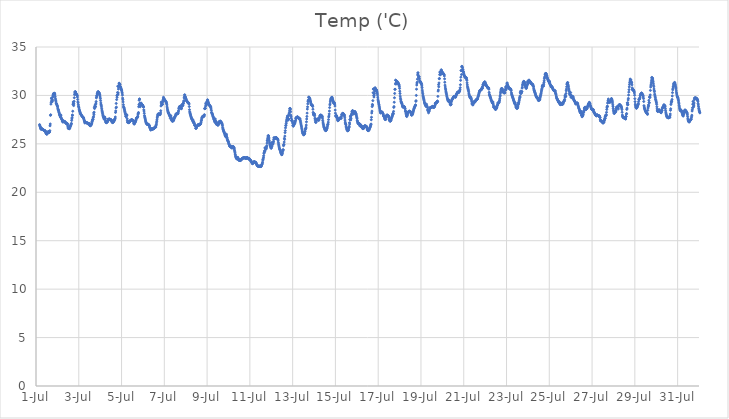
| Category | Temp ('C) |
|---|---|
| 44743.166666666664 | 26.988 |
| 44743.177083333336 | 26.906 |
| 44743.1875 | 26.806 |
| 44743.197916666664 | 26.741 |
| 44743.208333333336 | 26.634 |
| 44743.21875 | 26.656 |
| 44743.229166666664 | 26.513 |
| 44743.239583333336 | 26.539 |
| 44743.25 | 26.641 |
| 44743.260416666664 | 26.567 |
| 44743.270833333336 | 26.55 |
| 44743.28125 | 26.513 |
| 44743.291666666664 | 26.511 |
| 44743.302083333336 | 26.483 |
| 44743.3125 | 26.475 |
| 44743.322916666664 | 26.474 |
| 44743.333333333336 | 26.46 |
| 44743.34375 | 26.45 |
| 44743.354166666664 | 26.429 |
| 44743.364583333336 | 26.416 |
| 44743.375 | 26.395 |
| 44743.385416666664 | 26.378 |
| 44743.395833333336 | 26.348 |
| 44743.40625 | 26.352 |
| 44743.416666666664 | 26.364 |
| 44743.427083333336 | 26.352 |
| 44743.4375 | 26.308 |
| 44743.447916666664 | 26.232 |
| 44743.458333333336 | 26.173 |
| 44743.46875 | 26.1 |
| 44743.479166666664 | 26.058 |
| 44743.489583333336 | 26.029 |
| 44743.5 | 26.015 |
| 44743.510416666664 | 26.007 |
| 44743.520833333336 | 26.026 |
| 44743.53125 | 26.082 |
| 44743.541666666664 | 26.151 |
| 44743.552083333336 | 26.187 |
| 44743.5625 | 26.222 |
| 44743.572916666664 | 26.253 |
| 44743.583333333336 | 26.269 |
| 44743.59375 | 26.233 |
| 44743.604166666664 | 26.262 |
| 44743.614583333336 | 26.18 |
| 44743.625 | 26.202 |
| 44743.635416666664 | 26.241 |
| 44743.645833333336 | 26.361 |
| 44743.65625 | 26.865 |
| 44743.666666666664 | 27.052 |
| 44743.677083333336 | 27.94 |
| 44743.6875 | 28.002 |
| 44743.697916666664 | 29.102 |
| 44743.708333333336 | 29.297 |
| 44743.71875 | 29.723 |
| 44743.729166666664 | 29.654 |
| 44743.739583333336 | 29.479 |
| 44743.75 | 29.434 |
| 44743.760416666664 | 29.356 |
| 44743.770833333336 | 29.533 |
| 44743.78125 | 29.817 |
| 44743.791666666664 | 29.958 |
| 44743.802083333336 | 30.051 |
| 44743.8125 | 30.108 |
| 44743.822916666664 | 30.201 |
| 44743.833333333336 | 30.197 |
| 44743.84375 | 30.188 |
| 44743.854166666664 | 30.136 |
| 44743.864583333336 | 30.143 |
| 44743.875 | 30.231 |
| 44743.885416666664 | 30.05 |
| 44743.895833333336 | 29.87 |
| 44743.90625 | 29.69 |
| 44743.916666666664 | 29.534 |
| 44743.927083333336 | 29.438 |
| 44743.9375 | 29.321 |
| 44743.947916666664 | 29.168 |
| 44743.958333333336 | 29.138 |
| 44743.96875 | 29.11 |
| 44743.979166666664 | 29.02 |
| 44743.989583333336 | 28.963 |
| 44744.0 | 28.898 |
| 44744.010416666664 | 28.813 |
| 44744.020833333336 | 28.669 |
| 44744.03125 | 28.523 |
| 44744.041666666664 | 28.498 |
| 44744.052083333336 | 28.472 |
| 44744.0625 | 28.338 |
| 44744.072916666664 | 28.251 |
| 44744.083333333336 | 28.183 |
| 44744.09375 | 28.07 |
| 44744.104166666664 | 28.009 |
| 44744.114583333336 | 27.919 |
| 44744.125 | 27.907 |
| 44744.135416666664 | 27.788 |
| 44744.145833333336 | 27.76 |
| 44744.15625 | 27.995 |
| 44744.166666666664 | 27.897 |
| 44744.177083333336 | 27.677 |
| 44744.1875 | 27.629 |
| 44744.197916666664 | 27.587 |
| 44744.208333333336 | 27.513 |
| 44744.21875 | 27.473 |
| 44744.229166666664 | 27.348 |
| 44744.239583333336 | 27.412 |
| 44744.25 | 27.266 |
| 44744.260416666664 | 27.275 |
| 44744.270833333336 | 27.267 |
| 44744.28125 | 27.371 |
| 44744.291666666664 | 27.356 |
| 44744.302083333336 | 27.29 |
| 44744.3125 | 27.316 |
| 44744.322916666664 | 27.305 |
| 44744.333333333336 | 27.304 |
| 44744.34375 | 27.305 |
| 44744.354166666664 | 27.27 |
| 44744.364583333336 | 27.246 |
| 44744.375 | 27.216 |
| 44744.385416666664 | 27.171 |
| 44744.395833333336 | 27.162 |
| 44744.40625 | 27.133 |
| 44744.416666666664 | 27.117 |
| 44744.427083333336 | 27.079 |
| 44744.4375 | 27.081 |
| 44744.447916666664 | 27.105 |
| 44744.458333333336 | 27.11 |
| 44744.46875 | 27.054 |
| 44744.479166666664 | 26.946 |
| 44744.489583333336 | 26.792 |
| 44744.5 | 26.657 |
| 44744.510416666664 | 26.603 |
| 44744.520833333336 | 26.585 |
| 44744.53125 | 26.586 |
| 44744.541666666664 | 26.575 |
| 44744.552083333336 | 26.565 |
| 44744.5625 | 26.569 |
| 44744.572916666664 | 26.598 |
| 44744.583333333336 | 26.655 |
| 44744.59375 | 26.744 |
| 44744.604166666664 | 26.82 |
| 44744.614583333336 | 26.864 |
| 44744.625 | 26.926 |
| 44744.635416666664 | 26.994 |
| 44744.645833333336 | 27.052 |
| 44744.65625 | 27.111 |
| 44744.666666666664 | 27.414 |
| 44744.677083333336 | 27.584 |
| 44744.6875 | 27.714 |
| 44744.697916666664 | 27.975 |
| 44744.708333333336 | 27.94 |
| 44744.71875 | 28.368 |
| 44744.729166666664 | 29.084 |
| 44744.739583333336 | 29.32 |
| 44744.75 | 29.176 |
| 44744.760416666664 | 28.95 |
| 44744.770833333336 | 29.127 |
| 44744.78125 | 29.385 |
| 44744.791666666664 | 29.762 |
| 44744.802083333336 | 30.085 |
| 44744.8125 | 30.257 |
| 44744.822916666664 | 30.366 |
| 44744.833333333336 | 30.391 |
| 44744.84375 | 30.378 |
| 44744.854166666664 | 30.321 |
| 44744.864583333336 | 30.17 |
| 44744.875 | 30.141 |
| 44744.885416666664 | 30.133 |
| 44744.895833333336 | 30.131 |
| 44744.90625 | 30.065 |
| 44744.916666666664 | 30.016 |
| 44744.927083333336 | 30 |
| 44744.9375 | 29.835 |
| 44744.947916666664 | 29.582 |
| 44744.958333333336 | 29.33 |
| 44744.96875 | 29.243 |
| 44744.979166666664 | 29.043 |
| 44744.989583333336 | 28.878 |
| 44745.0 | 28.796 |
| 44745.010416666664 | 28.702 |
| 44745.020833333336 | 28.566 |
| 44745.03125 | 28.453 |
| 44745.041666666664 | 28.384 |
| 44745.052083333336 | 28.314 |
| 44745.0625 | 28.219 |
| 44745.072916666664 | 28.157 |
| 44745.083333333336 | 28.119 |
| 44745.09375 | 28.073 |
| 44745.104166666664 | 28.025 |
| 44745.114583333336 | 27.99 |
| 44745.125 | 27.943 |
| 44745.135416666664 | 27.901 |
| 44745.15625 | 27.859 |
| 44745.166666666664 | 27.816 |
| 44745.177083333336 | 27.802 |
| 44745.1875 | 27.78 |
| 44745.197916666664 | 27.748 |
| 44745.208333333336 | 27.723 |
| 44745.21875 | 27.7 |
| 44745.229166666664 | 27.643 |
| 44745.239583333336 | 27.541 |
| 44745.25 | 27.458 |
| 44745.260416666664 | 27.365 |
| 44745.270833333336 | 27.346 |
| 44745.28125 | 27.157 |
| 44745.291666666664 | 27.228 |
| 44745.302083333336 | 27.228 |
| 44745.3125 | 27.229 |
| 44745.322916666664 | 27.196 |
| 44745.333333333336 | 27.187 |
| 44745.34375 | 27.189 |
| 44745.354166666664 | 27.188 |
| 44745.364583333336 | 27.193 |
| 44745.375 | 27.203 |
| 44745.385416666664 | 27.155 |
| 44745.395833333336 | 27.141 |
| 44745.40625 | 27.132 |
| 44745.416666666664 | 27.1 |
| 44745.427083333336 | 27.08 |
| 44745.4375 | 27.077 |
| 44745.447916666664 | 27.065 |
| 44745.458333333336 | 27.109 |
| 44745.46875 | 27.107 |
| 44745.479166666664 | 27.089 |
| 44745.489583333336 | 27.036 |
| 44745.5 | 26.985 |
| 44745.510416666664 | 26.938 |
| 44745.520833333336 | 26.898 |
| 44745.53125 | 26.861 |
| 44745.541666666664 | 26.882 |
| 44745.552083333336 | 26.905 |
| 44745.5625 | 26.922 |
| 44745.572916666664 | 26.95 |
| 44745.583333333336 | 26.997 |
| 44745.59375 | 27.064 |
| 44745.604166666664 | 27.125 |
| 44745.614583333336 | 27.242 |
| 44745.625 | 27.304 |
| 44745.635416666664 | 27.389 |
| 44745.645833333336 | 27.505 |
| 44745.65625 | 27.532 |
| 44745.666666666664 | 27.546 |
| 44745.677083333336 | 27.715 |
| 44745.6875 | 27.813 |
| 44745.697916666664 | 28.187 |
| 44745.708333333336 | 28.014 |
| 44745.71875 | 28.27 |
| 44745.729166666664 | 28.75 |
| 44745.739583333336 | 28.647 |
| 44745.75 | 28.877 |
| 44745.760416666664 | 28.999 |
| 44745.770833333336 | 28.838 |
| 44745.78125 | 28.835 |
| 44745.791666666664 | 29.091 |
| 44745.802083333336 | 29.204 |
| 44745.8125 | 29.369 |
| 44745.822916666664 | 29.749 |
| 44745.833333333336 | 29.845 |
| 44745.84375 | 30.009 |
| 44745.854166666664 | 29.987 |
| 44745.864583333336 | 30.171 |
| 44745.875 | 30.237 |
| 44745.885416666664 | 30.313 |
| 44745.895833333336 | 30.375 |
| 44745.90625 | 30.376 |
| 44745.916666666664 | 30.373 |
| 44745.927083333336 | 30.309 |
| 44745.9375 | 30.301 |
| 44745.947916666664 | 30.284 |
| 44745.958333333336 | 30.217 |
| 44745.96875 | 30.134 |
| 44745.979166666664 | 30.078 |
| 44745.989583333336 | 29.944 |
| 44746.0 | 29.827 |
| 44746.010416666664 | 29.674 |
| 44746.020833333336 | 29.463 |
| 44746.03125 | 29.223 |
| 44746.041666666664 | 29.071 |
| 44746.052083333336 | 28.966 |
| 44746.0625 | 28.817 |
| 44746.072916666664 | 28.623 |
| 44746.083333333336 | 28.477 |
| 44746.09375 | 28.366 |
| 44746.104166666664 | 28.246 |
| 44746.114583333336 | 28.124 |
| 44746.125 | 27.993 |
| 44746.135416666664 | 27.906 |
| 44746.145833333336 | 27.822 |
| 44746.15625 | 27.762 |
| 44746.166666666664 | 27.695 |
| 44746.177083333336 | 27.644 |
| 44746.1875 | 27.561 |
| 44746.197916666664 | 27.53 |
| 44746.208333333336 | 27.75 |
| 44746.21875 | 27.763 |
| 44746.229166666664 | 27.622 |
| 44746.239583333336 | 27.609 |
| 44746.25 | 27.359 |
| 44746.260416666664 | 27.27 |
| 44746.270833333336 | 27.201 |
| 44746.28125 | 27.225 |
| 44746.291666666664 | 27.254 |
| 44746.302083333336 | 27.181 |
| 44746.3125 | 27.263 |
| 44746.322916666664 | 27.249 |
| 44746.333333333336 | 27.378 |
| 44746.34375 | 27.268 |
| 44746.354166666664 | 27.363 |
| 44746.364583333336 | 27.468 |
| 44746.375 | 27.558 |
| 44746.385416666664 | 27.5 |
| 44746.395833333336 | 27.532 |
| 44746.40625 | 27.476 |
| 44746.416666666664 | 27.516 |
| 44746.427083333336 | 27.546 |
| 44746.4375 | 27.566 |
| 44746.447916666664 | 27.546 |
| 44746.458333333336 | 27.551 |
| 44746.46875 | 27.505 |
| 44746.479166666664 | 27.448 |
| 44746.489583333336 | 27.464 |
| 44746.5 | 27.487 |
| 44746.510416666664 | 27.485 |
| 44746.520833333336 | 27.466 |
| 44746.53125 | 27.43 |
| 44746.541666666664 | 27.371 |
| 44746.552083333336 | 27.285 |
| 44746.5625 | 27.227 |
| 44746.572916666664 | 27.207 |
| 44746.583333333336 | 27.191 |
| 44746.59375 | 27.219 |
| 44746.604166666664 | 27.252 |
| 44746.614583333336 | 27.262 |
| 44746.625 | 27.303 |
| 44746.635416666664 | 27.339 |
| 44746.645833333336 | 27.355 |
| 44746.65625 | 27.423 |
| 44746.666666666664 | 27.451 |
| 44746.677083333336 | 27.53 |
| 44746.6875 | 27.569 |
| 44746.697916666664 | 27.633 |
| 44746.708333333336 | 27.776 |
| 44746.71875 | 28.242 |
| 44746.729166666664 | 28.4 |
| 44746.739583333336 | 28.714 |
| 44746.75 | 29.173 |
| 44746.760416666664 | 28.79 |
| 44746.770833333336 | 29.572 |
| 44746.78125 | 29.986 |
| 44746.791666666664 | 29.807 |
| 44746.802083333336 | 30.038 |
| 44746.8125 | 30.302 |
| 44746.822916666664 | 30.951 |
| 44746.833333333336 | 30.115 |
| 44746.84375 | 30.262 |
| 44746.854166666664 | 30.656 |
| 44746.864583333336 | 30.876 |
| 44746.875 | 30.978 |
| 44746.885416666664 | 31.266 |
| 44746.895833333336 | 31.229 |
| 44746.90625 | 31.188 |
| 44746.916666666664 | 31.166 |
| 44746.927083333336 | 31.118 |
| 44746.9375 | 30.942 |
| 44746.947916666664 | 30.865 |
| 44746.958333333336 | 30.849 |
| 44746.96875 | 30.767 |
| 44746.979166666664 | 30.701 |
| 44746.989583333336 | 30.616 |
| 44747.0 | 30.558 |
| 44747.010416666664 | 30.464 |
| 44747.020833333336 | 30.343 |
| 44747.03125 | 30.245 |
| 44747.041666666664 | 30.041 |
| 44747.052083333336 | 29.725 |
| 44747.0625 | 29.56 |
| 44747.072916666664 | 29.328 |
| 44747.083333333336 | 29.052 |
| 44747.09375 | 28.863 |
| 44747.104166666664 | 28.75 |
| 44747.114583333336 | 28.725 |
| 44747.125 | 28.623 |
| 44747.135416666664 | 28.534 |
| 44747.145833333336 | 28.411 |
| 44747.15625 | 28.317 |
| 44747.166666666664 | 28.227 |
| 44747.177083333336 | 28.112 |
| 44747.1875 | 28.007 |
| 44747.197916666664 | 27.84 |
| 44747.208333333336 | 27.87 |
| 44747.21875 | 27.792 |
| 44747.229166666664 | 27.984 |
| 44747.239583333336 | 28.016 |
| 44747.25 | 27.948 |
| 44747.260416666664 | 27.602 |
| 44747.270833333336 | 27.43 |
| 44747.28125 | 27.219 |
| 44747.291666666664 | 27.305 |
| 44747.302083333336 | 27.222 |
| 44747.3125 | 27.265 |
| 44747.322916666664 | 27.28 |
| 44747.333333333336 | 27.184 |
| 44747.34375 | 27.232 |
| 44747.354166666664 | 27.203 |
| 44747.364583333336 | 27.229 |
| 44747.375 | 27.268 |
| 44747.385416666664 | 27.28 |
| 44747.395833333336 | 27.362 |
| 44747.40625 | 27.382 |
| 44747.416666666664 | 27.416 |
| 44747.427083333336 | 27.431 |
| 44747.4375 | 27.43 |
| 44747.447916666664 | 27.455 |
| 44747.458333333336 | 27.483 |
| 44747.46875 | 27.485 |
| 44747.479166666664 | 27.481 |
| 44747.489583333336 | 27.485 |
| 44747.5 | 27.467 |
| 44747.510416666664 | 27.416 |
| 44747.520833333336 | 27.402 |
| 44747.53125 | 27.416 |
| 44747.541666666664 | 27.417 |
| 44747.552083333336 | 27.369 |
| 44747.5625 | 27.263 |
| 44747.572916666664 | 27.108 |
| 44747.583333333336 | 27.057 |
| 44747.59375 | 27.046 |
| 44747.604166666664 | 27.097 |
| 44747.614583333336 | 27.141 |
| 44747.625 | 27.178 |
| 44747.635416666664 | 27.234 |
| 44747.645833333336 | 27.278 |
| 44747.65625 | 27.34 |
| 44747.666666666664 | 27.426 |
| 44747.677083333336 | 27.48 |
| 44747.6875 | 27.575 |
| 44747.697916666664 | 27.649 |
| 44747.708333333336 | 27.702 |
| 44747.71875 | 27.701 |
| 44747.729166666664 | 27.707 |
| 44747.739583333336 | 27.717 |
| 44747.75 | 27.801 |
| 44747.760416666664 | 27.861 |
| 44747.770833333336 | 28.058 |
| 44747.78125 | 28.139 |
| 44747.791666666664 | 28.235 |
| 44747.802083333336 | 28.832 |
| 44747.8125 | 29.042 |
| 44747.822916666664 | 29.499 |
| 44747.833333333336 | 29.624 |
| 44747.84375 | 29.623 |
| 44747.854166666664 | 29.196 |
| 44747.864583333336 | 29.182 |
| 44747.875 | 28.835 |
| 44747.885416666664 | 28.968 |
| 44747.895833333336 | 29.147 |
| 44747.90625 | 29.216 |
| 44747.916666666664 | 29.192 |
| 44747.927083333336 | 29.147 |
| 44747.9375 | 29.11 |
| 44747.947916666664 | 29.062 |
| 44747.958333333336 | 29.039 |
| 44747.96875 | 29.007 |
| 44747.979166666664 | 29.008 |
| 44747.989583333336 | 28.964 |
| 44748.0 | 28.921 |
| 44748.010416666664 | 28.826 |
| 44748.020833333336 | 28.825 |
| 44748.03125 | 28.802 |
| 44748.041666666664 | 28.511 |
| 44748.052083333336 | 28.383 |
| 44748.0625 | 28.161 |
| 44748.072916666664 | 27.922 |
| 44748.083333333336 | 27.787 |
| 44748.09375 | 27.698 |
| 44748.104166666664 | 27.597 |
| 44748.114583333336 | 27.488 |
| 44748.125 | 27.366 |
| 44748.135416666664 | 27.276 |
| 44748.145833333336 | 27.2 |
| 44748.15625 | 27.136 |
| 44748.166666666664 | 27.119 |
| 44748.177083333336 | 27.073 |
| 44748.1875 | 27.041 |
| 44748.197916666664 | 27.015 |
| 44748.208333333336 | 27.014 |
| 44748.21875 | 27.001 |
| 44748.229166666664 | 26.989 |
| 44748.239583333336 | 27.035 |
| 44748.25 | 26.972 |
| 44748.260416666664 | 27.007 |
| 44748.270833333336 | 26.943 |
| 44748.28125 | 26.954 |
| 44748.291666666664 | 26.904 |
| 44748.302083333336 | 26.88 |
| 44748.3125 | 26.723 |
| 44748.322916666664 | 26.648 |
| 44748.333333333336 | 26.647 |
| 44748.34375 | 26.62 |
| 44748.354166666664 | 26.477 |
| 44748.364583333336 | 26.437 |
| 44748.375 | 26.438 |
| 44748.385416666664 | 26.519 |
| 44748.395833333336 | 26.514 |
| 44748.40625 | 26.554 |
| 44748.416666666664 | 26.526 |
| 44748.427083333336 | 26.511 |
| 44748.4375 | 26.513 |
| 44748.447916666664 | 26.557 |
| 44748.458333333336 | 26.548 |
| 44748.46875 | 26.551 |
| 44748.479166666664 | 26.544 |
| 44748.489583333336 | 26.55 |
| 44748.5 | 26.577 |
| 44748.510416666664 | 26.613 |
| 44748.520833333336 | 26.601 |
| 44748.53125 | 26.627 |
| 44748.541666666664 | 26.648 |
| 44748.552083333336 | 26.687 |
| 44748.5625 | 26.731 |
| 44748.572916666664 | 26.753 |
| 44748.583333333336 | 26.744 |
| 44748.59375 | 26.737 |
| 44748.604166666664 | 26.74 |
| 44748.614583333336 | 26.9 |
| 44748.625 | 27.002 |
| 44748.635416666664 | 27.164 |
| 44748.645833333336 | 27.327 |
| 44748.65625 | 27.485 |
| 44748.666666666664 | 27.679 |
| 44748.677083333336 | 27.801 |
| 44748.6875 | 27.932 |
| 44748.697916666664 | 28.024 |
| 44748.708333333336 | 28.07 |
| 44748.71875 | 28.096 |
| 44748.729166666664 | 28.064 |
| 44748.739583333336 | 28.089 |
| 44748.75 | 28.069 |
| 44748.760416666664 | 28.018 |
| 44748.770833333336 | 28.028 |
| 44748.78125 | 28.031 |
| 44748.791666666664 | 28.036 |
| 44748.802083333336 | 28.007 |
| 44748.8125 | 28.109 |
| 44748.822916666664 | 28.207 |
| 44748.833333333336 | 28.416 |
| 44748.84375 | 28.913 |
| 44748.854166666664 | 29.312 |
| 44748.864583333336 | 29.169 |
| 44748.875 | 29.025 |
| 44748.885416666664 | 29.11 |
| 44748.895833333336 | 29.084 |
| 44748.90625 | 29.06 |
| 44748.916666666664 | 29.091 |
| 44748.927083333336 | 29.313 |
| 44748.9375 | 29.463 |
| 44748.947916666664 | 29.583 |
| 44748.958333333336 | 29.809 |
| 44748.96875 | 29.672 |
| 44748.979166666664 | 29.721 |
| 44748.989583333336 | 29.66 |
| 44749.0 | 29.549 |
| 44749.010416666664 | 29.524 |
| 44749.020833333336 | 29.504 |
| 44749.03125 | 29.507 |
| 44749.041666666664 | 29.469 |
| 44749.052083333336 | 29.43 |
| 44749.0625 | 29.41 |
| 44749.072916666664 | 29.379 |
| 44749.083333333336 | 29.342 |
| 44749.09375 | 29.272 |
| 44749.104166666664 | 29.187 |
| 44749.114583333336 | 29.078 |
| 44749.125 | 28.898 |
| 44749.135416666664 | 28.718 |
| 44749.145833333336 | 28.581 |
| 44749.15625 | 28.453 |
| 44749.166666666664 | 28.358 |
| 44749.177083333336 | 28.276 |
| 44749.1875 | 28.212 |
| 44749.197916666664 | 28.177 |
| 44749.208333333336 | 28.133 |
| 44749.21875 | 28.07 |
| 44749.229166666664 | 27.988 |
| 44749.239583333336 | 27.959 |
| 44749.25 | 27.921 |
| 44749.260416666664 | 27.85 |
| 44749.270833333336 | 27.782 |
| 44749.28125 | 27.626 |
| 44749.291666666664 | 27.857 |
| 44749.302083333336 | 27.919 |
| 44749.3125 | 27.766 |
| 44749.322916666664 | 27.696 |
| 44749.333333333336 | 27.463 |
| 44749.34375 | 27.566 |
| 44749.354166666664 | 27.426 |
| 44749.364583333336 | 27.467 |
| 44749.375 | 27.321 |
| 44749.385416666664 | 27.465 |
| 44749.395833333336 | 27.382 |
| 44749.40625 | 27.346 |
| 44749.416666666664 | 27.392 |
| 44749.427083333336 | 27.417 |
| 44749.4375 | 27.459 |
| 44749.447916666664 | 27.482 |
| 44749.458333333336 | 27.601 |
| 44749.46875 | 27.664 |
| 44749.479166666664 | 27.751 |
| 44749.489583333336 | 27.763 |
| 44749.5 | 27.786 |
| 44749.510416666664 | 27.859 |
| 44749.520833333336 | 27.919 |
| 44749.53125 | 27.974 |
| 44749.541666666664 | 28.082 |
| 44749.552083333336 | 28.073 |
| 44749.5625 | 28.091 |
| 44749.572916666664 | 28.073 |
| 44749.583333333336 | 28.107 |
| 44749.59375 | 28.109 |
| 44749.604166666664 | 28.108 |
| 44749.614583333336 | 28.115 |
| 44749.625 | 28.109 |
| 44749.635416666664 | 28.133 |
| 44749.645833333336 | 28.193 |
| 44749.65625 | 28.312 |
| 44749.666666666664 | 28.426 |
| 44749.677083333336 | 28.624 |
| 44749.6875 | 28.705 |
| 44749.697916666664 | 28.78 |
| 44749.708333333336 | 28.841 |
| 44749.71875 | 28.853 |
| 44749.729166666664 | 28.853 |
| 44749.739583333336 | 28.88 |
| 44749.75 | 28.869 |
| 44749.760416666664 | 28.811 |
| 44749.770833333336 | 28.749 |
| 44749.78125 | 28.689 |
| 44749.791666666664 | 28.635 |
| 44749.802083333336 | 28.636 |
| 44749.8125 | 29.033 |
| 44749.822916666664 | 28.876 |
| 44749.833333333336 | 28.876 |
| 44749.84375 | 28.957 |
| 44749.854166666664 | 29.095 |
| 44749.864583333336 | 28.984 |
| 44749.875 | 29.022 |
| 44749.885416666664 | 29.211 |
| 44749.895833333336 | 29.198 |
| 44749.90625 | 29.392 |
| 44749.916666666664 | 29.453 |
| 44749.927083333336 | 29.817 |
| 44749.9375 | 29.708 |
| 44749.947916666664 | 30.054 |
| 44749.958333333336 | 30.051 |
| 44749.96875 | 29.905 |
| 44749.979166666664 | 29.875 |
| 44749.989583333336 | 29.777 |
| 44750.0 | 29.734 |
| 44750.010416666664 | 29.667 |
| 44750.020833333336 | 29.6 |
| 44750.03125 | 29.503 |
| 44750.041666666664 | 29.467 |
| 44750.052083333336 | 29.409 |
| 44750.0625 | 29.404 |
| 44750.072916666664 | 29.364 |
| 44750.083333333336 | 29.312 |
| 44750.09375 | 29.271 |
| 44750.104166666664 | 29.238 |
| 44750.114583333336 | 29.239 |
| 44750.125 | 29.228 |
| 44750.135416666664 | 29.227 |
| 44750.145833333336 | 29.181 |
| 44750.15625 | 29.107 |
| 44750.166666666664 | 28.85 |
| 44750.177083333336 | 28.53 |
| 44750.1875 | 28.314 |
| 44750.197916666664 | 28.208 |
| 44750.208333333336 | 28.129 |
| 44750.21875 | 28.029 |
| 44750.229166666664 | 27.956 |
| 44750.239583333336 | 27.866 |
| 44750.25 | 27.793 |
| 44750.260416666664 | 27.723 |
| 44750.270833333336 | 27.651 |
| 44750.28125 | 27.594 |
| 44750.291666666664 | 27.547 |
| 44750.302083333336 | 27.5 |
| 44750.3125 | 27.451 |
| 44750.322916666664 | 27.476 |
| 44750.333333333336 | 27.303 |
| 44750.34375 | 27.455 |
| 44750.354166666664 | 27.343 |
| 44750.364583333336 | 27.172 |
| 44750.375 | 27.248 |
| 44750.385416666664 | 27.235 |
| 44750.395833333336 | 27.135 |
| 44750.40625 | 27.076 |
| 44750.416666666664 | 26.921 |
| 44750.427083333336 | 26.93 |
| 44750.4375 | 26.87 |
| 44750.447916666664 | 26.882 |
| 44750.458333333336 | 26.8 |
| 44750.46875 | 26.609 |
| 44750.479166666664 | 26.601 |
| 44750.489583333336 | 26.602 |
| 44750.5 | 26.698 |
| 44750.510416666664 | 26.766 |
| 44750.520833333336 | 26.791 |
| 44750.53125 | 26.83 |
| 44750.541666666664 | 26.851 |
| 44750.552083333336 | 26.887 |
| 44750.5625 | 26.917 |
| 44750.572916666664 | 26.949 |
| 44750.583333333336 | 26.977 |
| 44750.59375 | 27.003 |
| 44750.604166666664 | 26.961 |
| 44750.614583333336 | 26.962 |
| 44750.625 | 26.977 |
| 44750.635416666664 | 26.963 |
| 44750.645833333336 | 26.949 |
| 44750.65625 | 26.981 |
| 44750.666666666664 | 27.014 |
| 44750.677083333336 | 27.029 |
| 44750.6875 | 27.039 |
| 44750.697916666664 | 27.081 |
| 44750.708333333336 | 27.164 |
| 44750.71875 | 27.252 |
| 44750.729166666664 | 27.387 |
| 44750.739583333336 | 27.47 |
| 44750.75 | 27.608 |
| 44750.760416666664 | 27.726 |
| 44750.770833333336 | 27.751 |
| 44750.78125 | 27.811 |
| 44750.791666666664 | 27.82 |
| 44750.802083333336 | 27.849 |
| 44750.8125 | 27.805 |
| 44750.822916666664 | 27.831 |
| 44750.833333333336 | 27.812 |
| 44750.84375 | 27.883 |
| 44750.854166666664 | 27.924 |
| 44750.864583333336 | 27.864 |
| 44750.875 | 28.013 |
| 44750.885416666664 | 28.643 |
| 44750.895833333336 | 28.627 |
| 44750.90625 | 28.694 |
| 44750.916666666664 | 28.662 |
| 44750.927083333336 | 28.9 |
| 44750.9375 | 29.198 |
| 44750.947916666664 | 29.112 |
| 44750.958333333336 | 29.034 |
| 44750.96875 | 29.022 |
| 44750.979166666664 | 29.104 |
| 44750.989583333336 | 29.328 |
| 44751.0 | 29.411 |
| 44751.010416666664 | 29.327 |
| 44751.020833333336 | 29.549 |
| 44751.03125 | 29.507 |
| 44751.041666666664 | 29.361 |
| 44751.052083333336 | 29.289 |
| 44751.0625 | 29.22 |
| 44751.072916666664 | 29.128 |
| 44751.083333333336 | 29.091 |
| 44751.09375 | 29.061 |
| 44751.104166666664 | 29.022 |
| 44751.114583333336 | 28.98 |
| 44751.125 | 28.942 |
| 44751.135416666664 | 28.885 |
| 44751.145833333336 | 28.88 |
| 44751.15625 | 28.859 |
| 44751.166666666664 | 28.832 |
| 44751.177083333336 | 28.719 |
| 44751.1875 | 28.603 |
| 44751.197916666664 | 28.457 |
| 44751.208333333336 | 28.243 |
| 44751.21875 | 28.217 |
| 44751.229166666664 | 28.126 |
| 44751.239583333336 | 28.081 |
| 44751.25 | 28.039 |
| 44751.260416666664 | 27.971 |
| 44751.270833333336 | 27.87 |
| 44751.28125 | 27.824 |
| 44751.291666666664 | 27.736 |
| 44751.302083333336 | 27.698 |
| 44751.3125 | 27.589 |
| 44751.322916666664 | 27.521 |
| 44751.333333333336 | 27.485 |
| 44751.34375 | 27.401 |
| 44751.354166666664 | 27.339 |
| 44751.364583333336 | 27.228 |
| 44751.375 | 27.293 |
| 44751.385416666664 | 27.569 |
| 44751.395833333336 | 27.385 |
| 44751.40625 | 27.285 |
| 44751.416666666664 | 27.109 |
| 44751.427083333336 | 27.253 |
| 44751.4375 | 27.015 |
| 44751.447916666664 | 27.039 |
| 44751.458333333336 | 27.081 |
| 44751.46875 | 27.166 |
| 44751.479166666664 | 27.068 |
| 44751.489583333336 | 27.026 |
| 44751.5 | 26.925 |
| 44751.510416666664 | 26.934 |
| 44751.520833333336 | 26.968 |
| 44751.53125 | 27.027 |
| 44751.541666666664 | 27.099 |
| 44751.552083333336 | 27.167 |
| 44751.5625 | 27.213 |
| 44751.572916666664 | 27.31 |
| 44751.583333333336 | 27.309 |
| 44751.59375 | 27.307 |
| 44751.604166666664 | 27.338 |
| 44751.614583333336 | 27.314 |
| 44751.625 | 27.343 |
| 44751.635416666664 | 27.321 |
| 44751.645833333336 | 27.208 |
| 44751.65625 | 27.192 |
| 44751.666666666664 | 27.219 |
| 44751.677083333336 | 27.196 |
| 44751.6875 | 27.146 |
| 44751.697916666664 | 27.074 |
| 44751.708333333336 | 26.993 |
| 44751.71875 | 26.866 |
| 44751.729166666664 | 26.679 |
| 44751.739583333336 | 26.559 |
| 44751.75 | 26.478 |
| 44751.760416666664 | 26.416 |
| 44751.770833333336 | 26.34 |
| 44751.78125 | 26.277 |
| 44751.791666666664 | 26.223 |
| 44751.802083333336 | 26.18 |
| 44751.8125 | 26.101 |
| 44751.822916666664 | 26.042 |
| 44751.833333333336 | 25.949 |
| 44751.84375 | 25.865 |
| 44751.854166666664 | 25.805 |
| 44751.864583333336 | 25.786 |
| 44751.875 | 25.753 |
| 44751.885416666664 | 25.716 |
| 44751.895833333336 | 25.7 |
| 44751.90625 | 25.991 |
| 44751.916666666664 | 25.805 |
| 44751.927083333336 | 25.649 |
| 44751.9375 | 25.59 |
| 44751.947916666664 | 25.451 |
| 44751.958333333336 | 25.382 |
| 44751.96875 | 25.328 |
| 44751.979166666664 | 25.279 |
| 44751.989583333336 | 25.237 |
| 44752.0 | 25.179 |
| 44752.010416666664 | 25.056 |
| 44752.020833333336 | 24.979 |
| 44752.03125 | 24.959 |
| 44752.041666666664 | 24.882 |
| 44752.052083333336 | 24.796 |
| 44752.0625 | 24.755 |
| 44752.072916666664 | 24.718 |
| 44752.083333333336 | 24.705 |
| 44752.09375 | 24.687 |
| 44752.104166666664 | 24.705 |
| 44752.114583333336 | 24.671 |
| 44752.125 | 24.725 |
| 44752.135416666664 | 24.737 |
| 44752.145833333336 | 24.692 |
| 44752.15625 | 24.561 |
| 44752.166666666664 | 24.685 |
| 44752.177083333336 | 24.717 |
| 44752.1875 | 24.601 |
| 44752.197916666664 | 24.626 |
| 44752.208333333336 | 24.682 |
| 44752.21875 | 24.708 |
| 44752.229166666664 | 24.706 |
| 44752.239583333336 | 24.683 |
| 44752.25 | 24.642 |
| 44752.260416666664 | 24.593 |
| 44752.270833333336 | 24.486 |
| 44752.28125 | 24.347 |
| 44752.291666666664 | 24.225 |
| 44752.302083333336 | 24.085 |
| 44752.3125 | 23.944 |
| 44752.322916666664 | 23.851 |
| 44752.333333333336 | 23.718 |
| 44752.34375 | 23.649 |
| 44752.354166666664 | 23.584 |
| 44752.364583333336 | 23.528 |
| 44752.375 | 23.498 |
| 44752.385416666664 | 23.468 |
| 44752.395833333336 | 23.454 |
| 44752.40625 | 23.441 |
| 44752.416666666664 | 23.45 |
| 44752.427083333336 | 23.597 |
| 44752.4375 | 23.597 |
| 44752.447916666664 | 23.457 |
| 44752.458333333336 | 23.422 |
| 44752.46875 | 23.455 |
| 44752.479166666664 | 23.342 |
| 44752.489583333336 | 23.315 |
| 44752.5 | 23.294 |
| 44752.510416666664 | 23.311 |
| 44752.520833333336 | 23.316 |
| 44752.53125 | 23.295 |
| 44752.541666666664 | 23.291 |
| 44752.552083333336 | 23.282 |
| 44752.5625 | 23.309 |
| 44752.572916666664 | 23.307 |
| 44752.583333333336 | 23.326 |
| 44752.59375 | 23.361 |
| 44752.604166666664 | 23.377 |
| 44752.614583333336 | 23.419 |
| 44752.625 | 23.468 |
| 44752.635416666664 | 23.504 |
| 44752.645833333336 | 23.516 |
| 44752.65625 | 23.503 |
| 44752.666666666664 | 23.522 |
| 44752.677083333336 | 23.524 |
| 44752.6875 | 23.525 |
| 44752.697916666664 | 23.546 |
| 44752.708333333336 | 23.567 |
| 44752.71875 | 23.564 |
| 44752.729166666664 | 23.564 |
| 44752.739583333336 | 23.56 |
| 44752.75 | 23.561 |
| 44752.760416666664 | 23.549 |
| 44752.770833333336 | 23.562 |
| 44752.78125 | 23.569 |
| 44752.791666666664 | 23.546 |
| 44752.802083333336 | 23.519 |
| 44752.8125 | 23.508 |
| 44752.822916666664 | 23.507 |
| 44752.833333333336 | 23.519 |
| 44752.84375 | 23.539 |
| 44752.854166666664 | 23.567 |
| 44752.864583333336 | 23.585 |
| 44752.875 | 23.589 |
| 44752.885416666664 | 23.576 |
| 44752.895833333336 | 23.551 |
| 44752.90625 | 23.528 |
| 44752.916666666664 | 23.508 |
| 44752.927083333336 | 23.494 |
| 44752.9375 | 23.485 |
| 44752.947916666664 | 23.459 |
| 44752.958333333336 | 23.472 |
| 44752.96875 | 23.487 |
| 44752.979166666664 | 23.383 |
| 44752.989583333336 | 23.358 |
| 44753.0 | 23.401 |
| 44753.010416666664 | 23.341 |
| 44753.020833333336 | 23.308 |
| 44753.03125 | 23.298 |
| 44753.041666666664 | 23.267 |
| 44753.052083333336 | 23.245 |
| 44753.0625 | 23.184 |
| 44753.072916666664 | 23.156 |
| 44753.083333333336 | 23.095 |
| 44753.09375 | 23.062 |
| 44753.104166666664 | 23.019 |
| 44753.114583333336 | 22.949 |
| 44753.125 | 22.975 |
| 44753.135416666664 | 22.998 |
| 44753.145833333336 | 22.984 |
| 44753.15625 | 23.061 |
| 44753.166666666664 | 23.077 |
| 44753.177083333336 | 23.12 |
| 44753.1875 | 23.131 |
| 44753.197916666664 | 23.16 |
| 44753.208333333336 | 23.145 |
| 44753.21875 | 23.132 |
| 44753.229166666664 | 23.121 |
| 44753.239583333336 | 23.091 |
| 44753.25 | 23.08 |
| 44753.260416666664 | 23.104 |
| 44753.270833333336 | 23.101 |
| 44753.28125 | 23.054 |
| 44753.291666666664 | 23.022 |
| 44753.302083333336 | 22.965 |
| 44753.3125 | 22.892 |
| 44753.322916666664 | 22.843 |
| 44753.333333333336 | 22.815 |
| 44753.34375 | 22.771 |
| 44753.354166666664 | 22.737 |
| 44753.364583333336 | 22.715 |
| 44753.375 | 22.705 |
| 44753.385416666664 | 22.697 |
| 44753.395833333336 | 22.688 |
| 44753.40625 | 22.684 |
| 44753.416666666664 | 22.68 |
| 44753.427083333336 | 22.672 |
| 44753.4375 | 22.666 |
| 44753.447916666664 | 22.663 |
| 44753.458333333336 | 22.69 |
| 44753.46875 | 22.727 |
| 44753.479166666664 | 22.707 |
| 44753.489583333336 | 22.686 |
| 44753.5 | 22.683 |
| 44753.510416666664 | 22.655 |
| 44753.520833333336 | 22.652 |
| 44753.53125 | 22.729 |
| 44753.541666666664 | 22.739 |
| 44753.552083333336 | 22.825 |
| 44753.5625 | 22.87 |
| 44753.572916666664 | 22.915 |
| 44753.583333333336 | 23.004 |
| 44753.59375 | 23.115 |
| 44753.604166666664 | 23.337 |
| 44753.614583333336 | 23.34 |
| 44753.625 | 23.458 |
| 44753.635416666664 | 23.607 |
| 44753.645833333336 | 23.776 |
| 44753.65625 | 24.009 |
| 44753.666666666664 | 24.075 |
| 44753.677083333336 | 24.154 |
| 44753.6875 | 24.287 |
| 44753.697916666664 | 24.236 |
| 44753.708333333336 | 24.608 |
| 44753.71875 | 24.535 |
| 44753.729166666664 | 24.569 |
| 44753.739583333336 | 24.516 |
| 44753.75 | 24.433 |
| 44753.760416666664 | 24.542 |
| 44753.770833333336 | 24.581 |
| 44753.78125 | 24.709 |
| 44753.791666666664 | 24.814 |
| 44753.802083333336 | 25.081 |
| 44753.8125 | 25.319 |
| 44753.822916666664 | 25.388 |
| 44753.833333333336 | 25.569 |
| 44753.84375 | 25.705 |
| 44753.854166666664 | 25.823 |
| 44753.864583333336 | 25.857 |
| 44753.875 | 25.82 |
| 44753.885416666664 | 25.667 |
| 44753.895833333336 | 25.506 |
| 44753.90625 | 25.332 |
| 44753.916666666664 | 25.173 |
| 44753.927083333336 | 25.028 |
| 44753.9375 | 24.945 |
| 44753.947916666664 | 24.872 |
| 44753.958333333336 | 24.758 |
| 44753.96875 | 24.716 |
| 44753.979166666664 | 24.637 |
| 44753.989583333336 | 24.562 |
| 44754.0 | 24.543 |
| 44754.010416666664 | 24.665 |
| 44754.020833333336 | 25.129 |
| 44754.03125 | 24.748 |
| 44754.041666666664 | 25.027 |
| 44754.052083333336 | 25.066 |
| 44754.0625 | 24.931 |
| 44754.072916666664 | 24.978 |
| 44754.083333333336 | 25.046 |
| 44754.09375 | 25.16 |
| 44754.104166666664 | 25.264 |
| 44754.114583333336 | 25.45 |
| 44754.125 | 25.643 |
| 44754.135416666664 | 25.602 |
| 44754.145833333336 | 25.567 |
| 44754.15625 | 25.587 |
| 44754.166666666664 | 25.572 |
| 44754.177083333336 | 25.58 |
| 44754.1875 | 25.632 |
| 44754.197916666664 | 25.607 |
| 44754.208333333336 | 25.556 |
| 44754.21875 | 25.648 |
| 44754.229166666664 | 25.641 |
| 44754.239583333336 | 25.623 |
| 44754.25 | 25.604 |
| 44754.260416666664 | 25.594 |
| 44754.270833333336 | 25.517 |
| 44754.28125 | 25.516 |
| 44754.291666666664 | 25.527 |
| 44754.302083333336 | 25.488 |
| 44754.3125 | 25.412 |
| 44754.322916666664 | 25.307 |
| 44754.333333333336 | 25.12 |
| 44754.34375 | 24.969 |
| 44754.354166666664 | 24.845 |
| 44754.364583333336 | 24.71 |
| 44754.375 | 24.595 |
| 44754.385416666664 | 24.505 |
| 44754.395833333336 | 24.45 |
| 44754.40625 | 24.396 |
| 44754.416666666664 | 24.336 |
| 44754.427083333336 | 24.259 |
| 44754.4375 | 24.162 |
| 44754.447916666664 | 24.088 |
| 44754.458333333336 | 24.022 |
| 44754.46875 | 23.965 |
| 44754.479166666664 | 23.912 |
| 44754.489583333336 | 23.885 |
| 44754.5 | 23.878 |
| 44754.510416666664 | 24.034 |
| 44754.520833333336 | 24.059 |
| 44754.53125 | 24.212 |
| 44754.541666666664 | 24.382 |
| 44754.552083333336 | 24.35 |
| 44754.5625 | 24.388 |
| 44754.572916666664 | 24.806 |
| 44754.583333333336 | 24.941 |
| 44754.59375 | 24.901 |
| 44754.604166666664 | 25.187 |
| 44754.614583333336 | 25.573 |
| 44754.625 | 25.457 |
| 44754.635416666664 | 25.8 |
| 44754.645833333336 | 26.157 |
| 44754.65625 | 26.366 |
| 44754.666666666664 | 26.652 |
| 44754.677083333336 | 26.875 |
| 44754.6875 | 26.932 |
| 44754.697916666664 | 27.097 |
| 44754.708333333336 | 27.275 |
| 44754.71875 | 27.422 |
| 44754.729166666664 | 27.537 |
| 44754.739583333336 | 27.665 |
| 44754.75 | 27.739 |
| 44754.760416666664 | 27.893 |
| 44754.770833333336 | 27.795 |
| 44754.78125 | 27.573 |
| 44754.791666666664 | 27.461 |
| 44754.802083333336 | 27.506 |
| 44754.8125 | 27.594 |
| 44754.822916666664 | 27.931 |
| 44754.833333333336 | 28.1 |
| 44754.84375 | 28.203 |
| 44754.854166666664 | 28.4 |
| 44754.864583333336 | 28.607 |
| 44754.875 | 28.669 |
| 44754.885416666664 | 28.64 |
| 44754.895833333336 | 28.538 |
| 44754.90625 | 28.317 |
| 44754.916666666664 | 27.968 |
| 44754.927083333336 | 27.822 |
| 44754.9375 | 27.647 |
| 44754.947916666664 | 27.401 |
| 44754.958333333336 | 27.418 |
| 44754.96875 | 27.419 |
| 44754.979166666664 | 27.365 |
| 44754.989583333336 | 27.281 |
| 44755.0 | 27.138 |
| 44755.010416666664 | 26.911 |
| 44755.020833333336 | 26.925 |
| 44755.03125 | 26.814 |
| 44755.041666666664 | 26.968 |
| 44755.052083333336 | 26.954 |
| 44755.0625 | 26.95 |
| 44755.072916666664 | 27.043 |
| 44755.083333333336 | 27.182 |
| 44755.09375 | 27.089 |
| 44755.104166666664 | 27.158 |
| 44755.114583333336 | 27.245 |
| 44755.125 | 27.353 |
| 44755.135416666664 | 27.413 |
| 44755.145833333336 | 27.606 |
| 44755.15625 | 27.706 |
| 44755.166666666664 | 27.652 |
| 44755.177083333336 | 27.638 |
| 44755.1875 | 27.721 |
| 44755.197916666664 | 27.744 |
| 44755.208333333336 | 27.761 |
| 44755.21875 | 27.796 |
| 44755.229166666664 | 27.77 |
| 44755.239583333336 | 27.76 |
| 44755.25 | 27.735 |
| 44755.260416666664 | 27.665 |
| 44755.270833333336 | 27.729 |
| 44755.28125 | 27.688 |
| 44755.291666666664 | 27.647 |
| 44755.302083333336 | 27.611 |
| 44755.3125 | 27.596 |
| 44755.322916666664 | 27.615 |
| 44755.333333333336 | 27.601 |
| 44755.34375 | 27.559 |
| 44755.354166666664 | 27.443 |
| 44755.364583333336 | 27.34 |
| 44755.375 | 27.194 |
| 44755.385416666664 | 27.065 |
| 44755.395833333336 | 26.956 |
| 44755.40625 | 26.852 |
| 44755.416666666664 | 26.732 |
| 44755.427083333336 | 26.572 |
| 44755.4375 | 26.444 |
| 44755.447916666664 | 26.321 |
| 44755.458333333336 | 26.237 |
| 44755.46875 | 26.128 |
| 44755.479166666664 | 26.089 |
| 44755.489583333336 | 26.042 |
| 44755.5 | 25.973 |
| 44755.510416666664 | 25.963 |
| 44755.520833333336 | 25.92 |
| 44755.53125 | 25.992 |
| 44755.541666666664 | 26.022 |
| 44755.552083333336 | 26.016 |
| 44755.5625 | 26.093 |
| 44755.572916666664 | 26.247 |
| 44755.583333333336 | 26.324 |
| 44755.59375 | 26.493 |
| 44755.604166666664 | 26.581 |
| 44755.614583333336 | 26.576 |
| 44755.625 | 26.722 |
| 44755.635416666664 | 26.941 |
| 44755.645833333336 | 27.272 |
| 44755.65625 | 27.569 |
| 44755.666666666664 | 27.831 |
| 44755.677083333336 | 28.174 |
| 44755.6875 | 28.592 |
| 44755.697916666664 | 28.822 |
| 44755.708333333336 | 29.129 |
| 44755.71875 | 29.359 |
| 44755.729166666664 | 29.475 |
| 44755.739583333336 | 29.548 |
| 44755.75 | 29.821 |
| 44755.760416666664 | 29.802 |
| 44755.770833333336 | 29.814 |
| 44755.78125 | 29.718 |
| 44755.791666666664 | 29.695 |
| 44755.802083333336 | 29.653 |
| 44755.8125 | 29.591 |
| 44755.822916666664 | 29.481 |
| 44755.833333333336 | 29.366 |
| 44755.84375 | 29.311 |
| 44755.854166666664 | 29.186 |
| 44755.864583333336 | 29.103 |
| 44755.875 | 29.05 |
| 44755.885416666664 | 29.003 |
| 44755.895833333336 | 28.989 |
| 44755.90625 | 28.97 |
| 44755.916666666664 | 28.984 |
| 44755.927083333336 | 28.979 |
| 44755.9375 | 28.851 |
| 44755.947916666664 | 28.574 |
| 44755.958333333336 | 28.247 |
| 44755.96875 | 28.091 |
| 44755.979166666664 | 27.982 |
| 44755.989583333336 | 28.003 |
| 44756.0 | 28.089 |
| 44756.010416666664 | 28.118 |
| 44756.020833333336 | 28.025 |
| 44756.03125 | 27.903 |
| 44756.041666666664 | 27.653 |
| 44756.052083333336 | 27.56 |
| 44756.0625 | 27.404 |
| 44756.072916666664 | 27.252 |
| 44756.083333333336 | 27.206 |
| 44756.09375 | 27.543 |
| 44756.104166666664 | 27.279 |
| 44756.114583333336 | 27.48 |
| 44756.125 | 27.498 |
| 44756.135416666664 | 27.54 |
| 44756.145833333336 | 27.537 |
| 44756.15625 | 27.561 |
| 44756.166666666664 | 27.562 |
| 44756.177083333336 | 27.491 |
| 44756.1875 | 27.495 |
| 44756.197916666664 | 27.518 |
| 44756.208333333336 | 27.491 |
| 44756.21875 | 27.42 |
| 44756.229166666664 | 27.494 |
| 44756.239583333336 | 27.587 |
| 44756.25 | 27.699 |
| 44756.260416666664 | 27.723 |
| 44756.270833333336 | 27.843 |
| 44756.28125 | 27.914 |
| 44756.291666666664 | 27.953 |
| 44756.302083333336 | 27.898 |
| 44756.3125 | 27.985 |
| 44756.322916666664 | 27.904 |
| 44756.333333333336 | 27.948 |
| 44756.34375 | 27.926 |
| 44756.354166666664 | 27.85 |
| 44756.364583333336 | 27.881 |
| 44756.375 | 27.87 |
| 44756.385416666664 | 27.809 |
| 44756.395833333336 | 27.657 |
| 44756.40625 | 27.435 |
| 44756.416666666664 | 27.255 |
| 44756.427083333336 | 27.137 |
| 44756.4375 | 27.015 |
| 44756.447916666664 | 26.891 |
| 44756.458333333336 | 26.771 |
| 44756.46875 | 26.713 |
| 44756.479166666664 | 26.666 |
| 44756.489583333336 | 26.615 |
| 44756.5 | 26.518 |
| 44756.510416666664 | 26.457 |
| 44756.520833333336 | 26.42 |
| 44756.53125 | 26.395 |
| 44756.541666666664 | 26.372 |
| 44756.552083333336 | 26.362 |
| 44756.5625 | 26.388 |
| 44756.572916666664 | 26.424 |
| 44756.583333333336 | 26.538 |
| 44756.59375 | 26.555 |
| 44756.604166666664 | 26.563 |
| 44756.614583333336 | 26.667 |
| 44756.625 | 26.813 |
| 44756.635416666664 | 26.958 |
| 44756.645833333336 | 27.018 |
| 44756.65625 | 27.054 |
| 44756.666666666664 | 27.244 |
| 44756.677083333336 | 27.501 |
| 44756.6875 | 27.777 |
| 44756.697916666664 | 27.876 |
| 44756.708333333336 | 28.09 |
| 44756.71875 | 28.388 |
| 44756.729166666664 | 28.743 |
| 44756.739583333336 | 29.02 |
| 44756.75 | 29.121 |
| 44756.760416666664 | 29.335 |
| 44756.770833333336 | 29.468 |
| 44756.78125 | 29.594 |
| 44756.791666666664 | 29.67 |
| 44756.802083333336 | 29.649 |
| 44756.8125 | 29.765 |
| 44756.822916666664 | 29.783 |
| 44756.833333333336 | 29.801 |
| 44756.84375 | 29.816 |
| 44756.854166666664 | 29.706 |
| 44756.864583333336 | 29.618 |
| 44756.875 | 29.532 |
| 44756.885416666664 | 29.475 |
| 44756.895833333336 | 29.376 |
| 44756.90625 | 29.266 |
| 44756.916666666664 | 29.203 |
| 44756.927083333336 | 29.224 |
| 44756.9375 | 29.254 |
| 44756.947916666664 | 29.242 |
| 44756.958333333336 | 29.168 |
| 44756.96875 | 29.1 |
| 44756.979166666664 | 28.905 |
| 44756.989583333336 | 28.491 |
| 44757.0 | 28.166 |
| 44757.010416666664 | 27.926 |
| 44757.020833333336 | 27.823 |
| 44757.03125 | 27.85 |
| 44757.041666666664 | 27.91 |
| 44757.052083333336 | 27.918 |
| 44757.0625 | 27.848 |
| 44757.072916666664 | 27.761 |
| 44757.083333333336 | 27.659 |
| 44757.09375 | 27.572 |
| 44757.104166666664 | 27.454 |
| 44757.114583333336 | 27.382 |
| 44757.125 | 27.471 |
| 44757.135416666664 | 27.593 |
| 44757.145833333336 | 27.43 |
| 44757.15625 | 27.522 |
| 44757.166666666664 | 27.573 |
| 44757.177083333336 | 27.583 |
| 44757.1875 | 27.569 |
| 44757.197916666664 | 27.614 |
| 44757.208333333336 | 27.627 |
| 44757.21875 | 27.67 |
| 44757.229166666664 | 27.707 |
| 44757.239583333336 | 27.685 |
| 44757.25 | 27.685 |
| 44757.260416666664 | 27.689 |
| 44757.270833333336 | 27.623 |
| 44757.28125 | 27.818 |
| 44757.291666666664 | 27.985 |
| 44757.302083333336 | 28.03 |
| 44757.3125 | 28.077 |
| 44757.322916666664 | 28.099 |
| 44757.333333333336 | 28.149 |
| 44757.34375 | 28.04 |
| 44757.354166666664 | 28.14 |
| 44757.364583333336 | 28.131 |
| 44757.375 | 28.095 |
| 44757.385416666664 | 28.006 |
| 44757.395833333336 | 27.997 |
| 44757.40625 | 28.009 |
| 44757.416666666664 | 27.968 |
| 44757.427083333336 | 27.862 |
| 44757.4375 | 27.683 |
| 44757.447916666664 | 27.453 |
| 44757.458333333336 | 27.245 |
| 44757.46875 | 27.118 |
| 44757.479166666664 | 27.042 |
| 44757.489583333336 | 26.968 |
| 44757.5 | 26.821 |
| 44757.510416666664 | 26.702 |
| 44757.520833333336 | 26.632 |
| 44757.53125 | 26.513 |
| 44757.541666666664 | 26.451 |
| 44757.552083333336 | 26.415 |
| 44757.5625 | 26.365 |
| 44757.572916666664 | 26.355 |
| 44757.583333333336 | 26.382 |
| 44757.59375 | 26.367 |
| 44757.604166666664 | 26.405 |
| 44757.614583333336 | 26.52 |
| 44757.625 | 26.671 |
| 44757.635416666664 | 26.685 |
| 44757.645833333336 | 26.814 |
| 44757.65625 | 27.181 |
| 44757.666666666664 | 27.042 |
| 44757.677083333336 | 27.505 |
| 44757.6875 | 27.502 |
| 44757.697916666664 | 27.794 |
| 44757.708333333336 | 27.883 |
| 44757.71875 | 27.465 |
| 44757.729166666664 | 27.641 |
| 44757.739583333336 | 27.917 |
| 44757.75 | 27.999 |
| 44757.760416666664 | 28.125 |
| 44757.770833333336 | 28.296 |
| 44757.78125 | 28.371 |
| 44757.791666666664 | 28.402 |
| 44757.802083333336 | 28.424 |
| 44757.8125 | 28.419 |
| 44757.822916666664 | 28.348 |
| 44757.833333333336 | 28.261 |
| 44757.84375 | 28.216 |
| 44757.854166666664 | 28.081 |
| 44757.864583333336 | 28.181 |
| 44757.875 | 28.203 |
| 44757.885416666664 | 28.25 |
| 44757.895833333336 | 28.279 |
| 44757.90625 | 28.326 |
| 44757.916666666664 | 28.332 |
| 44757.927083333336 | 28.255 |
| 44757.9375 | 28.175 |
| 44757.947916666664 | 28.163 |
| 44757.958333333336 | 28.133 |
| 44757.96875 | 28.058 |
| 44757.979166666664 | 27.955 |
| 44757.989583333336 | 27.829 |
| 44758.0 | 27.706 |
| 44758.010416666664 | 27.605 |
| 44758.020833333336 | 27.424 |
| 44758.03125 | 27.334 |
| 44758.041666666664 | 27.228 |
| 44758.052083333336 | 27.149 |
| 44758.0625 | 27.078 |
| 44758.072916666664 | 27.105 |
| 44758.083333333336 | 27.109 |
| 44758.09375 | 27.11 |
| 44758.104166666664 | 27.108 |
| 44758.114583333336 | 27.097 |
| 44758.125 | 27.015 |
| 44758.135416666664 | 26.873 |
| 44758.145833333336 | 26.883 |
| 44758.15625 | 26.998 |
| 44758.166666666664 | 26.999 |
| 44758.177083333336 | 26.941 |
| 44758.1875 | 26.856 |
| 44758.197916666664 | 26.797 |
| 44758.208333333336 | 26.77 |
| 44758.21875 | 26.76 |
| 44758.229166666664 | 26.772 |
| 44758.239583333336 | 26.837 |
| 44758.25 | 26.654 |
| 44758.260416666664 | 26.658 |
| 44758.270833333336 | 26.595 |
| 44758.28125 | 26.569 |
| 44758.291666666664 | 26.572 |
| 44758.302083333336 | 26.579 |
| 44758.3125 | 26.585 |
| 44758.322916666664 | 26.647 |
| 44758.333333333336 | 26.734 |
| 44758.34375 | 26.759 |
| 44758.354166666664 | 26.792 |
| 44758.364583333336 | 26.845 |
| 44758.375 | 26.869 |
| 44758.385416666664 | 26.863 |
| 44758.395833333336 | 26.841 |
| 44758.40625 | 26.83 |
| 44758.416666666664 | 26.811 |
| 44758.427083333336 | 26.786 |
| 44758.4375 | 26.803 |
| 44758.447916666664 | 26.809 |
| 44758.458333333336 | 26.777 |
| 44758.46875 | 26.704 |
| 44758.479166666664 | 26.599 |
| 44758.489583333336 | 26.517 |
| 44758.5 | 26.463 |
| 44758.510416666664 | 26.41 |
| 44758.520833333336 | 26.366 |
| 44758.53125 | 26.361 |
| 44758.541666666664 | 26.379 |
| 44758.552083333336 | 26.385 |
| 44758.5625 | 26.407 |
| 44758.572916666664 | 26.463 |
| 44758.583333333336 | 26.539 |
| 44758.59375 | 26.574 |
| 44758.604166666664 | 26.631 |
| 44758.614583333336 | 26.684 |
| 44758.625 | 26.736 |
| 44758.635416666664 | 26.803 |
| 44758.645833333336 | 26.898 |
| 44758.65625 | 27.002 |
| 44758.666666666664 | 27.044 |
| 44758.677083333336 | 27.489 |
| 44758.6875 | 27.749 |
| 44758.697916666664 | 28.185 |
| 44758.708333333336 | 28.375 |
| 44758.71875 | 28.846 |
| 44758.729166666664 | 29.068 |
| 44758.739583333336 | 29 |
| 44758.75 | 29.464 |
| 44758.760416666664 | 30.279 |
| 44758.770833333336 | 30.653 |
| 44758.78125 | 30.674 |
| 44758.791666666664 | 29.993 |
| 44758.802083333336 | 29.838 |
| 44758.8125 | 30.051 |
| 44758.822916666664 | 30.22 |
| 44758.833333333336 | 30.453 |
| 44758.84375 | 30.47 |
| 44758.854166666664 | 30.799 |
| 44758.864583333336 | 30.733 |
| 44758.875 | 30.627 |
| 44758.885416666664 | 30.649 |
| 44758.895833333336 | 30.606 |
| 44758.90625 | 30.602 |
| 44758.916666666664 | 30.567 |
| 44758.927083333336 | 30.502 |
| 44758.9375 | 30.425 |
| 44758.947916666664 | 30.331 |
| 44758.958333333336 | 30.217 |
| 44758.96875 | 30.05 |
| 44758.979166666664 | 29.822 |
| 44758.989583333336 | 29.618 |
| 44759.0 | 29.452 |
| 44759.010416666664 | 29.339 |
| 44759.020833333336 | 29.218 |
| 44759.03125 | 29.087 |
| 44759.041666666664 | 28.999 |
| 44759.052083333336 | 28.861 |
| 44759.0625 | 28.715 |
| 44759.072916666664 | 28.591 |
| 44759.083333333336 | 28.442 |
| 44759.09375 | 28.331 |
| 44759.104166666664 | 28.217 |
| 44759.114583333336 | 28.19 |
| 44759.125 | 28.242 |
| 44759.135416666664 | 28.275 |
| 44759.145833333336 | 28.302 |
| 44759.15625 | 28.293 |
| 44759.166666666664 | 28.279 |
| 44759.177083333336 | 28.248 |
| 44759.1875 | 28.217 |
| 44759.197916666664 | 28.274 |
| 44759.208333333336 | 28.156 |
| 44759.21875 | 28.141 |
| 44759.229166666664 | 28.087 |
| 44759.239583333336 | 27.998 |
| 44759.25 | 27.896 |
| 44759.260416666664 | 27.86 |
| 44759.270833333336 | 27.834 |
| 44759.28125 | 27.796 |
| 44759.291666666664 | 27.728 |
| 44759.302083333336 | 27.634 |
| 44759.3125 | 27.582 |
| 44759.322916666664 | 27.518 |
| 44759.333333333336 | 27.518 |
| 44759.34375 | 27.55 |
| 44759.354166666664 | 27.521 |
| 44759.364583333336 | 27.761 |
| 44759.375 | 27.834 |
| 44759.385416666664 | 27.922 |
| 44759.395833333336 | 27.916 |
| 44759.40625 | 27.965 |
| 44759.416666666664 | 27.985 |
| 44759.427083333336 | 27.957 |
| 44759.4375 | 27.928 |
| 44759.447916666664 | 27.916 |
| 44759.458333333336 | 27.829 |
| 44759.46875 | 27.878 |
| 44759.479166666664 | 27.893 |
| 44759.489583333336 | 27.866 |
| 44759.5 | 27.764 |
| 44759.510416666664 | 27.609 |
| 44759.520833333336 | 27.504 |
| 44759.53125 | 27.438 |
| 44759.541666666664 | 27.387 |
| 44759.552083333336 | 27.345 |
| 44759.5625 | 27.355 |
| 44759.572916666664 | 27.363 |
| 44759.583333333336 | 27.39 |
| 44759.59375 | 27.426 |
| 44759.604166666664 | 27.5 |
| 44759.614583333336 | 27.61 |
| 44759.625 | 27.688 |
| 44759.635416666664 | 27.737 |
| 44759.645833333336 | 27.801 |
| 44759.65625 | 27.87 |
| 44759.666666666664 | 27.939 |
| 44759.677083333336 | 28.037 |
| 44759.6875 | 28.115 |
| 44759.697916666664 | 28.165 |
| 44759.708333333336 | 28.098 |
| 44759.71875 | 28.35 |
| 44759.729166666664 | 28.761 |
| 44759.739583333336 | 28.849 |
| 44759.75 | 29.297 |
| 44759.760416666664 | 29.758 |
| 44759.770833333336 | 30.205 |
| 44759.78125 | 30.629 |
| 44759.791666666664 | 30.634 |
| 44759.802083333336 | 31.184 |
| 44759.8125 | 31.574 |
| 44759.822916666664 | 31.562 |
| 44759.833333333336 | 31.296 |
| 44759.84375 | 31.19 |
| 44759.854166666664 | 31.377 |
| 44759.864583333336 | 31.372 |
| 44759.875 | 31.46 |
| 44759.885416666664 | 31.44 |
| 44759.895833333336 | 31.364 |
| 44759.90625 | 31.358 |
| 44759.916666666664 | 31.272 |
| 44759.927083333336 | 31.269 |
| 44759.9375 | 31.281 |
| 44759.947916666664 | 31.226 |
| 44759.958333333336 | 31.147 |
| 44759.96875 | 31.1 |
| 44759.979166666664 | 31.049 |
| 44759.989583333336 | 30.907 |
| 44760.0 | 30.726 |
| 44760.010416666664 | 30.438 |
| 44760.020833333336 | 30.201 |
| 44760.03125 | 29.924 |
| 44760.041666666664 | 29.715 |
| 44760.052083333336 | 29.563 |
| 44760.0625 | 29.416 |
| 44760.072916666664 | 29.333 |
| 44760.083333333336 | 29.293 |
| 44760.09375 | 29.246 |
| 44760.104166666664 | 29.183 |
| 44760.114583333336 | 29.109 |
| 44760.125 | 29.016 |
| 44760.135416666664 | 28.92 |
| 44760.145833333336 | 28.839 |
| 44760.15625 | 28.799 |
| 44760.166666666664 | 28.791 |
| 44760.177083333336 | 28.816 |
| 44760.1875 | 28.829 |
| 44760.197916666664 | 28.847 |
| 44760.208333333336 | 28.837 |
| 44760.21875 | 28.82 |
| 44760.229166666664 | 28.821 |
| 44760.239583333336 | 28.794 |
| 44760.25 | 28.672 |
| 44760.260416666664 | 28.601 |
| 44760.270833333336 | 28.377 |
| 44760.28125 | 28.392 |
| 44760.291666666664 | 28.28 |
| 44760.302083333336 | 28.148 |
| 44760.3125 | 28.015 |
| 44760.322916666664 | 27.884 |
| 44760.333333333336 | 27.817 |
| 44760.34375 | 27.96 |
| 44760.354166666664 | 27.899 |
| 44760.364583333336 | 28.003 |
| 44760.375 | 28.128 |
| 44760.385416666664 | 28.16 |
| 44760.395833333336 | 28.259 |
| 44760.40625 | 28.276 |
| 44760.416666666664 | 28.317 |
| 44760.427083333336 | 28.334 |
| 44760.4375 | 28.363 |
| 44760.447916666664 | 28.362 |
| 44760.458333333336 | 28.357 |
| 44760.46875 | 28.364 |
| 44760.479166666664 | 28.366 |
| 44760.489583333336 | 28.291 |
| 44760.5 | 28.327 |
| 44760.510416666664 | 28.324 |
| 44760.520833333336 | 28.286 |
| 44760.53125 | 28.199 |
| 44760.541666666664 | 28.083 |
| 44760.552083333336 | 27.984 |
| 44760.5625 | 27.972 |
| 44760.572916666664 | 27.986 |
| 44760.583333333336 | 27.992 |
| 44760.59375 | 28.016 |
| 44760.604166666664 | 28.073 |
| 44760.614583333336 | 28.143 |
| 44760.625 | 28.239 |
| 44760.635416666664 | 28.316 |
| 44760.645833333336 | 28.419 |
| 44760.65625 | 28.501 |
| 44760.666666666664 | 28.591 |
| 44760.677083333336 | 28.654 |
| 44760.6875 | 28.717 |
| 44760.697916666664 | 28.767 |
| 44760.708333333336 | 28.825 |
| 44760.71875 | 28.882 |
| 44760.729166666664 | 28.932 |
| 44760.739583333336 | 29.012 |
| 44760.75 | 28.999 |
| 44760.760416666664 | 29.388 |
| 44760.770833333336 | 29.457 |
| 44760.78125 | 30.003 |
| 44760.791666666664 | 30.647 |
| 44760.802083333336 | 31.076 |
| 44760.8125 | 31.271 |
| 44760.822916666664 | 31.362 |
| 44760.833333333336 | 31.676 |
| 44760.84375 | 32.12 |
| 44760.854166666664 | 32.315 |
| 44760.864583333336 | 32.34 |
| 44760.875 | 32.092 |
| 44760.885416666664 | 31.875 |
| 44760.895833333336 | 31.915 |
| 44760.90625 | 31.922 |
| 44760.916666666664 | 31.913 |
| 44760.927083333336 | 31.721 |
| 44760.9375 | 31.54 |
| 44760.947916666664 | 31.462 |
| 44760.958333333336 | 31.433 |
| 44760.96875 | 31.412 |
| 44760.979166666664 | 31.389 |
| 44760.989583333336 | 31.36 |
| 44761.0 | 31.263 |
| 44761.010416666664 | 31.244 |
| 44761.020833333336 | 31.238 |
| 44761.03125 | 31.125 |
| 44761.041666666664 | 30.982 |
| 44761.052083333336 | 30.797 |
| 44761.0625 | 30.546 |
| 44761.072916666664 | 30.351 |
| 44761.083333333336 | 30.178 |
| 44761.09375 | 30.022 |
| 44761.104166666664 | 29.883 |
| 44761.114583333336 | 29.778 |
| 44761.125 | 29.662 |
| 44761.135416666664 | 29.569 |
| 44761.145833333336 | 29.462 |
| 44761.15625 | 29.327 |
| 44761.166666666664 | 29.254 |
| 44761.177083333336 | 29.187 |
| 44761.1875 | 29.117 |
| 44761.197916666664 | 29.051 |
| 44761.208333333336 | 28.984 |
| 44761.21875 | 28.963 |
| 44761.229166666664 | 28.932 |
| 44761.239583333336 | 28.883 |
| 44761.25 | 28.856 |
| 44761.260416666664 | 29.098 |
| 44761.270833333336 | 28.942 |
| 44761.28125 | 28.84 |
| 44761.291666666664 | 28.792 |
| 44761.302083333336 | 28.766 |
| 44761.3125 | 28.541 |
| 44761.322916666664 | 28.456 |
| 44761.333333333336 | 28.415 |
| 44761.34375 | 28.366 |
| 44761.354166666664 | 28.201 |
| 44761.364583333336 | 28.395 |
| 44761.375 | 28.342 |
| 44761.385416666664 | 28.404 |
| 44761.395833333336 | 28.53 |
| 44761.40625 | 28.617 |
| 44761.416666666664 | 28.679 |
| 44761.427083333336 | 28.706 |
| 44761.4375 | 28.751 |
| 44761.447916666664 | 28.753 |
| 44761.458333333336 | 28.767 |
| 44761.46875 | 28.772 |
| 44761.479166666664 | 28.762 |
| 44761.489583333336 | 28.764 |
| 44761.5 | 28.773 |
| 44761.510416666664 | 28.805 |
| 44761.520833333336 | 28.823 |
| 44761.53125 | 28.825 |
| 44761.541666666664 | 28.858 |
| 44761.552083333336 | 28.879 |
| 44761.5625 | 28.873 |
| 44761.572916666664 | 28.781 |
| 44761.583333333336 | 28.753 |
| 44761.59375 | 28.769 |
| 44761.604166666664 | 28.786 |
| 44761.614583333336 | 28.779 |
| 44761.625 | 28.828 |
| 44761.635416666664 | 28.862 |
| 44761.645833333336 | 28.916 |
| 44761.65625 | 28.996 |
| 44761.666666666664 | 29.139 |
| 44761.677083333336 | 29.212 |
| 44761.6875 | 29.217 |
| 44761.697916666664 | 29.221 |
| 44761.708333333336 | 29.207 |
| 44761.71875 | 29.212 |
| 44761.729166666664 | 29.228 |
| 44761.739583333336 | 29.282 |
| 44761.75 | 29.342 |
| 44761.760416666664 | 29.405 |
| 44761.770833333336 | 29.418 |
| 44761.78125 | 29.345 |
| 44761.791666666664 | 29.904 |
| 44761.802083333336 | 30.445 |
| 44761.8125 | 30.559 |
| 44761.822916666664 | 31.108 |
| 44761.833333333336 | 30.894 |
| 44761.84375 | 31.29 |
| 44761.854166666664 | 31.727 |
| 44761.864583333336 | 31.746 |
| 44761.875 | 32.142 |
| 44761.885416666664 | 32.367 |
| 44761.895833333336 | 32.449 |
| 44761.90625 | 32.221 |
| 44761.916666666664 | 32.137 |
| 44761.927083333336 | 32.262 |
| 44761.9375 | 32.478 |
| 44761.947916666664 | 32.647 |
| 44761.958333333336 | 32.585 |
| 44761.96875 | 32.52 |
| 44761.979166666664 | 32.438 |
| 44761.989583333336 | 32.384 |
| 44762.0 | 32.384 |
| 44762.010416666664 | 32.348 |
| 44762.020833333336 | 32.287 |
| 44762.03125 | 32.316 |
| 44762.041666666664 | 32.241 |
| 44762.052083333336 | 32.186 |
| 44762.0625 | 32.203 |
| 44762.072916666664 | 32.184 |
| 44762.083333333336 | 32.131 |
| 44762.09375 | 32.007 |
| 44762.104166666664 | 31.71 |
| 44762.114583333336 | 31.364 |
| 44762.125 | 31.063 |
| 44762.135416666664 | 30.872 |
| 44762.145833333336 | 30.702 |
| 44762.15625 | 30.577 |
| 44762.166666666664 | 30.432 |
| 44762.177083333336 | 30.303 |
| 44762.1875 | 30.199 |
| 44762.197916666664 | 30.066 |
| 44762.208333333336 | 29.935 |
| 44762.21875 | 29.836 |
| 44762.229166666664 | 29.732 |
| 44762.239583333336 | 29.662 |
| 44762.25 | 29.568 |
| 44762.260416666664 | 29.513 |
| 44762.270833333336 | 29.446 |
| 44762.28125 | 29.384 |
| 44762.291666666664 | 29.552 |
| 44762.302083333336 | 29.51 |
| 44762.3125 | 29.415 |
| 44762.322916666664 | 29.397 |
| 44762.333333333336 | 29.361 |
| 44762.34375 | 29.309 |
| 44762.354166666664 | 29.222 |
| 44762.364583333336 | 29.114 |
| 44762.375 | 29.072 |
| 44762.385416666664 | 29.018 |
| 44762.395833333336 | 29.042 |
| 44762.40625 | 29.253 |
| 44762.416666666664 | 29.101 |
| 44762.427083333336 | 29.405 |
| 44762.4375 | 29.491 |
| 44762.447916666664 | 29.576 |
| 44762.458333333336 | 29.625 |
| 44762.46875 | 29.638 |
| 44762.479166666664 | 29.67 |
| 44762.489583333336 | 29.695 |
| 44762.5 | 29.743 |
| 44762.510416666664 | 29.801 |
| 44762.520833333336 | 29.834 |
| 44762.53125 | 29.869 |
| 44762.541666666664 | 29.886 |
| 44762.552083333336 | 29.891 |
| 44762.5625 | 29.903 |
| 44762.572916666664 | 29.879 |
| 44762.583333333336 | 29.866 |
| 44762.59375 | 29.878 |
| 44762.604166666664 | 29.852 |
| 44762.614583333336 | 29.801 |
| 44762.625 | 29.892 |
| 44762.635416666664 | 29.967 |
| 44762.645833333336 | 30.016 |
| 44762.65625 | 30.118 |
| 44762.666666666664 | 30.13 |
| 44762.677083333336 | 30.147 |
| 44762.6875 | 30.215 |
| 44762.697916666664 | 30.286 |
| 44762.708333333336 | 30.332 |
| 44762.71875 | 30.322 |
| 44762.729166666664 | 30.358 |
| 44762.739583333336 | 30.319 |
| 44762.75 | 30.324 |
| 44762.760416666664 | 30.347 |
| 44762.770833333336 | 30.297 |
| 44762.78125 | 30.371 |
| 44762.791666666664 | 30.4 |
| 44762.802083333336 | 30.431 |
| 44762.8125 | 30.479 |
| 44762.822916666664 | 30.618 |
| 44762.833333333336 | 30.797 |
| 44762.84375 | 31.105 |
| 44762.854166666664 | 31.558 |
| 44762.864583333336 | 31.884 |
| 44762.875 | 32.57 |
| 44762.885416666664 | 32.566 |
| 44762.895833333336 | 32.161 |
| 44762.90625 | 32.974 |
| 44762.916666666664 | 33.014 |
| 44762.927083333336 | 32.907 |
| 44762.9375 | 32.88 |
| 44762.947916666664 | 32.672 |
| 44762.958333333336 | 32.681 |
| 44762.96875 | 32.505 |
| 44762.979166666664 | 32.472 |
| 44762.989583333336 | 32.385 |
| 44763.0 | 32.238 |
| 44763.010416666664 | 32.16 |
| 44763.020833333336 | 32.076 |
| 44763.03125 | 32.019 |
| 44763.041666666664 | 31.958 |
| 44763.052083333336 | 31.915 |
| 44763.0625 | 31.899 |
| 44763.072916666664 | 31.855 |
| 44763.083333333336 | 31.841 |
| 44763.09375 | 31.838 |
| 44763.104166666664 | 31.837 |
| 44763.114583333336 | 31.842 |
| 44763.125 | 31.769 |
| 44763.135416666664 | 31.656 |
| 44763.145833333336 | 31.553 |
| 44763.15625 | 31.299 |
| 44763.166666666664 | 31.092 |
| 44763.177083333336 | 30.911 |
| 44763.1875 | 30.799 |
| 44763.197916666664 | 30.715 |
| 44763.208333333336 | 30.611 |
| 44763.21875 | 30.521 |
| 44763.229166666664 | 30.389 |
| 44763.239583333336 | 30.236 |
| 44763.25 | 30.12 |
| 44763.260416666664 | 30.021 |
| 44763.270833333336 | 29.943 |
| 44763.28125 | 29.864 |
| 44763.291666666664 | 29.81 |
| 44763.302083333336 | 29.757 |
| 44763.3125 | 29.702 |
| 44763.322916666664 | 29.749 |
| 44763.333333333336 | 29.818 |
| 44763.34375 | 29.712 |
| 44763.354166666664 | 29.631 |
| 44763.364583333336 | 29.516 |
| 44763.375 | 29.353 |
| 44763.385416666664 | 29.194 |
| 44763.395833333336 | 29.082 |
| 44763.40625 | 29.19 |
| 44763.416666666664 | 29.15 |
| 44763.427083333336 | 29.013 |
| 44763.4375 | 29.064 |
| 44763.447916666664 | 29.215 |
| 44763.458333333336 | 29.292 |
| 44763.46875 | 29.328 |
| 44763.479166666664 | 29.347 |
| 44763.489583333336 | 29.311 |
| 44763.5 | 29.286 |
| 44763.510416666664 | 29.301 |
| 44763.520833333336 | 29.324 |
| 44763.53125 | 29.362 |
| 44763.541666666664 | 29.405 |
| 44763.552083333336 | 29.451 |
| 44763.5625 | 29.505 |
| 44763.572916666664 | 29.527 |
| 44763.583333333336 | 29.54 |
| 44763.59375 | 29.573 |
| 44763.604166666664 | 29.574 |
| 44763.614583333336 | 29.593 |
| 44763.625 | 29.612 |
| 44763.635416666664 | 29.636 |
| 44763.645833333336 | 29.657 |
| 44763.65625 | 29.756 |
| 44763.666666666664 | 29.857 |
| 44763.677083333336 | 29.927 |
| 44763.6875 | 29.995 |
| 44763.697916666664 | 30.08 |
| 44763.708333333336 | 30.205 |
| 44763.71875 | 30.277 |
| 44763.729166666664 | 30.353 |
| 44763.739583333336 | 30.421 |
| 44763.75 | 30.479 |
| 44763.760416666664 | 30.526 |
| 44763.770833333336 | 30.546 |
| 44763.78125 | 30.503 |
| 44763.791666666664 | 30.572 |
| 44763.802083333336 | 30.575 |
| 44763.8125 | 30.619 |
| 44763.822916666664 | 30.63 |
| 44763.833333333336 | 30.6 |
| 44763.84375 | 30.741 |
| 44763.854166666664 | 30.718 |
| 44763.864583333336 | 30.85 |
| 44763.875 | 30.735 |
| 44763.885416666664 | 30.917 |
| 44763.895833333336 | 31.108 |
| 44763.90625 | 31.066 |
| 44763.916666666664 | 31.169 |
| 44763.927083333336 | 31.285 |
| 44763.9375 | 31.116 |
| 44763.947916666664 | 31.141 |
| 44763.958333333336 | 31.167 |
| 44763.96875 | 31.373 |
| 44763.979166666664 | 31.37 |
| 44763.989583333336 | 31.407 |
| 44764.0 | 31.32 |
| 44764.010416666664 | 31.263 |
| 44764.020833333336 | 31.218 |
| 44764.03125 | 31.16 |
| 44764.041666666664 | 31.108 |
| 44764.052083333336 | 31.035 |
| 44764.0625 | 31.003 |
| 44764.072916666664 | 30.986 |
| 44764.083333333336 | 30.925 |
| 44764.09375 | 30.898 |
| 44764.104166666664 | 30.857 |
| 44764.114583333336 | 30.81 |
| 44764.125 | 30.792 |
| 44764.135416666664 | 30.766 |
| 44764.145833333336 | 30.793 |
| 44764.15625 | 30.794 |
| 44764.166666666664 | 30.745 |
| 44764.177083333336 | 30.639 |
| 44764.1875 | 30.317 |
| 44764.197916666664 | 30.127 |
| 44764.208333333336 | 30.035 |
| 44764.21875 | 29.976 |
| 44764.229166666664 | 29.913 |
| 44764.239583333336 | 29.833 |
| 44764.25 | 29.777 |
| 44764.260416666664 | 29.718 |
| 44764.270833333336 | 29.631 |
| 44764.28125 | 29.531 |
| 44764.291666666664 | 29.489 |
| 44764.302083333336 | 29.451 |
| 44764.3125 | 29.379 |
| 44764.322916666664 | 29.31 |
| 44764.333333333336 | 29.24 |
| 44764.34375 | 29.215 |
| 44764.354166666664 | 29.258 |
| 44764.364583333336 | 29.329 |
| 44764.375 | 29.134 |
| 44764.385416666664 | 29.008 |
| 44764.395833333336 | 28.815 |
| 44764.40625 | 28.809 |
| 44764.416666666664 | 28.775 |
| 44764.427083333336 | 28.757 |
| 44764.4375 | 28.74 |
| 44764.447916666664 | 28.824 |
| 44764.458333333336 | 28.772 |
| 44764.46875 | 28.59 |
| 44764.479166666664 | 28.587 |
| 44764.489583333336 | 28.548 |
| 44764.5 | 28.572 |
| 44764.510416666664 | 28.655 |
| 44764.520833333336 | 28.689 |
| 44764.53125 | 28.702 |
| 44764.541666666664 | 28.742 |
| 44764.552083333336 | 28.817 |
| 44764.5625 | 28.943 |
| 44764.572916666664 | 28.968 |
| 44764.583333333336 | 29.045 |
| 44764.59375 | 29.167 |
| 44764.604166666664 | 29.247 |
| 44764.614583333336 | 29.244 |
| 44764.625 | 29.215 |
| 44764.635416666664 | 29.21 |
| 44764.645833333336 | 29.277 |
| 44764.65625 | 29.312 |
| 44764.666666666664 | 29.423 |
| 44764.677083333336 | 29.526 |
| 44764.6875 | 29.707 |
| 44764.697916666664 | 29.921 |
| 44764.708333333336 | 30.029 |
| 44764.71875 | 30.254 |
| 44764.729166666664 | 30.375 |
| 44764.739583333336 | 30.535 |
| 44764.75 | 30.62 |
| 44764.760416666664 | 30.697 |
| 44764.770833333336 | 30.714 |
| 44764.78125 | 30.702 |
| 44764.791666666664 | 30.679 |
| 44764.802083333336 | 30.648 |
| 44764.8125 | 30.581 |
| 44764.822916666664 | 30.486 |
| 44764.833333333336 | 30.411 |
| 44764.84375 | 30.352 |
| 44764.854166666664 | 30.327 |
| 44764.864583333336 | 30.306 |
| 44764.875 | 30.281 |
| 44764.885416666664 | 30.252 |
| 44764.895833333336 | 30.279 |
| 44764.90625 | 30.278 |
| 44764.916666666664 | 30.323 |
| 44764.927083333336 | 30.261 |
| 44764.9375 | 30.539 |
| 44764.947916666664 | 30.618 |
| 44764.958333333336 | 30.88 |
| 44764.96875 | 30.771 |
| 44764.979166666664 | 30.586 |
| 44764.989583333336 | 30.691 |
| 44765.0 | 30.864 |
| 44765.010416666664 | 31.057 |
| 44765.020833333336 | 31.247 |
| 44765.03125 | 31.295 |
| 44765.041666666664 | 31.141 |
| 44765.052083333336 | 31.068 |
| 44765.0625 | 31.018 |
| 44765.072916666664 | 30.915 |
| 44765.083333333336 | 30.893 |
| 44765.09375 | 30.835 |
| 44765.104166666664 | 30.792 |
| 44765.114583333336 | 30.759 |
| 44765.125 | 30.729 |
| 44765.135416666664 | 30.714 |
| 44765.145833333336 | 30.696 |
| 44765.15625 | 30.665 |
| 44765.166666666664 | 30.663 |
| 44765.177083333336 | 30.662 |
| 44765.1875 | 30.668 |
| 44765.197916666664 | 30.658 |
| 44765.208333333336 | 30.587 |
| 44765.21875 | 30.488 |
| 44765.229166666664 | 30.272 |
| 44765.239583333336 | 30.139 |
| 44765.25 | 30.063 |
| 44765.260416666664 | 29.988 |
| 44765.270833333336 | 29.924 |
| 44765.28125 | 29.855 |
| 44765.291666666664 | 29.791 |
| 44765.302083333336 | 29.71 |
| 44765.3125 | 29.647 |
| 44765.322916666664 | 29.569 |
| 44765.333333333336 | 29.496 |
| 44765.34375 | 29.436 |
| 44765.354166666664 | 29.364 |
| 44765.364583333336 | 29.295 |
| 44765.375 | 29.22 |
| 44765.385416666664 | 29.138 |
| 44765.395833333336 | 29.138 |
| 44765.40625 | 29.242 |
| 44765.416666666664 | 29.078 |
| 44765.427083333336 | 29.016 |
| 44765.4375 | 28.839 |
| 44765.447916666664 | 28.758 |
| 44765.458333333336 | 28.807 |
| 44765.46875 | 28.751 |
| 44765.479166666664 | 28.649 |
| 44765.489583333336 | 28.711 |
| 44765.5 | 28.769 |
| 44765.510416666664 | 28.674 |
| 44765.520833333336 | 28.76 |
| 44765.53125 | 28.89 |
| 44765.541666666664 | 29.025 |
| 44765.552083333336 | 29.23 |
| 44765.5625 | 29.112 |
| 44765.572916666664 | 29.229 |
| 44765.583333333336 | 29.333 |
| 44765.59375 | 29.496 |
| 44765.604166666664 | 29.635 |
| 44765.614583333336 | 29.773 |
| 44765.625 | 29.929 |
| 44765.635416666664 | 29.833 |
| 44765.645833333336 | 30.291 |
| 44765.65625 | 30.431 |
| 44765.666666666664 | 30.192 |
| 44765.677083333336 | 30.237 |
| 44765.6875 | 30.233 |
| 44765.697916666664 | 30.36 |
| 44765.708333333336 | 30.419 |
| 44765.71875 | 30.385 |
| 44765.729166666664 | 30.755 |
| 44765.739583333336 | 30.852 |
| 44765.75 | 31.06 |
| 44765.760416666664 | 31.148 |
| 44765.770833333336 | 31.265 |
| 44765.78125 | 31.336 |
| 44765.791666666664 | 31.4 |
| 44765.802083333336 | 31.453 |
| 44765.8125 | 31.422 |
| 44765.822916666664 | 31.414 |
| 44765.833333333336 | 31.379 |
| 44765.84375 | 31.293 |
| 44765.854166666664 | 31.222 |
| 44765.864583333336 | 31.138 |
| 44765.875 | 30.949 |
| 44765.885416666664 | 30.994 |
| 44765.895833333336 | 30.84 |
| 44765.90625 | 30.781 |
| 44765.916666666664 | 30.762 |
| 44765.927083333336 | 30.72 |
| 44765.9375 | 30.963 |
| 44765.947916666664 | 30.877 |
| 44765.958333333336 | 31.018 |
| 44765.96875 | 31.115 |
| 44765.979166666664 | 31.312 |
| 44765.989583333336 | 31.428 |
| 44766.0 | 31.49 |
| 44766.010416666664 | 31.204 |
| 44766.020833333336 | 31.319 |
| 44766.03125 | 31.36 |
| 44766.041666666664 | 31.365 |
| 44766.052083333336 | 31.592 |
| 44766.0625 | 31.514 |
| 44766.072916666664 | 31.436 |
| 44766.083333333336 | 31.438 |
| 44766.09375 | 31.426 |
| 44766.104166666664 | 31.441 |
| 44766.114583333336 | 31.388 |
| 44766.125 | 31.34 |
| 44766.135416666664 | 31.314 |
| 44766.145833333336 | 31.265 |
| 44766.15625 | 31.238 |
| 44766.166666666664 | 31.216 |
| 44766.177083333336 | 31.191 |
| 44766.1875 | 31.165 |
| 44766.197916666664 | 31.165 |
| 44766.208333333336 | 31.147 |
| 44766.21875 | 31.142 |
| 44766.229166666664 | 31.127 |
| 44766.239583333336 | 31.023 |
| 44766.25 | 30.949 |
| 44766.260416666664 | 30.912 |
| 44766.270833333336 | 30.743 |
| 44766.28125 | 30.612 |
| 44766.291666666664 | 30.515 |
| 44766.302083333336 | 30.46 |
| 44766.3125 | 30.4 |
| 44766.322916666664 | 30.332 |
| 44766.333333333336 | 30.271 |
| 44766.34375 | 30.204 |
| 44766.354166666664 | 30.111 |
| 44766.364583333336 | 30.036 |
| 44766.375 | 29.969 |
| 44766.385416666664 | 29.916 |
| 44766.395833333336 | 29.87 |
| 44766.40625 | 29.826 |
| 44766.416666666664 | 29.762 |
| 44766.427083333336 | 29.738 |
| 44766.4375 | 29.753 |
| 44766.447916666664 | 29.788 |
| 44766.458333333336 | 29.703 |
| 44766.46875 | 29.646 |
| 44766.479166666664 | 29.594 |
| 44766.489583333336 | 29.483 |
| 44766.5 | 29.472 |
| 44766.510416666664 | 29.521 |
| 44766.520833333336 | 29.563 |
| 44766.53125 | 29.543 |
| 44766.541666666664 | 29.517 |
| 44766.552083333336 | 29.586 |
| 44766.5625 | 29.649 |
| 44766.572916666664 | 29.795 |
| 44766.583333333336 | 29.92 |
| 44766.59375 | 30.001 |
| 44766.604166666664 | 30.123 |
| 44766.614583333336 | 30.216 |
| 44766.625 | 30.348 |
| 44766.635416666664 | 30.477 |
| 44766.645833333336 | 30.615 |
| 44766.65625 | 30.734 |
| 44766.666666666664 | 30.886 |
| 44766.677083333336 | 30.983 |
| 44766.6875 | 31.046 |
| 44766.697916666664 | 31.028 |
| 44766.708333333336 | 31.064 |
| 44766.71875 | 30.961 |
| 44766.729166666664 | 30.961 |
| 44766.739583333336 | 31.159 |
| 44766.75 | 31.338 |
| 44766.760416666664 | 31.509 |
| 44766.770833333336 | 31.726 |
| 44766.78125 | 31.838 |
| 44766.791666666664 | 31.938 |
| 44766.802083333336 | 32.134 |
| 44766.8125 | 32.223 |
| 44766.822916666664 | 32.264 |
| 44766.833333333336 | 32.268 |
| 44766.84375 | 32.27 |
| 44766.854166666664 | 32.242 |
| 44766.864583333336 | 32.118 |
| 44766.875 | 32.076 |
| 44766.885416666664 | 32.031 |
| 44766.895833333336 | 31.916 |
| 44766.90625 | 31.842 |
| 44766.916666666664 | 31.759 |
| 44766.927083333336 | 31.682 |
| 44766.9375 | 31.639 |
| 44766.947916666664 | 31.554 |
| 44766.958333333336 | 31.49 |
| 44766.96875 | 31.427 |
| 44766.979166666664 | 31.519 |
| 44766.989583333336 | 31.471 |
| 44767.0 | 31.281 |
| 44767.010416666664 | 31.44 |
| 44767.020833333336 | 31.373 |
| 44767.03125 | 31.196 |
| 44767.041666666664 | 31.117 |
| 44767.052083333336 | 31.093 |
| 44767.0625 | 31.036 |
| 44767.072916666664 | 30.988 |
| 44767.083333333336 | 30.886 |
| 44767.09375 | 30.921 |
| 44767.104166666664 | 30.884 |
| 44767.114583333336 | 30.931 |
| 44767.125 | 30.894 |
| 44767.135416666664 | 30.835 |
| 44767.145833333336 | 30.794 |
| 44767.15625 | 30.731 |
| 44767.166666666664 | 30.684 |
| 44767.177083333336 | 30.639 |
| 44767.1875 | 30.585 |
| 44767.197916666664 | 30.552 |
| 44767.208333333336 | 30.517 |
| 44767.21875 | 30.503 |
| 44767.229166666664 | 30.468 |
| 44767.239583333336 | 30.459 |
| 44767.25 | 30.486 |
| 44767.260416666664 | 30.494 |
| 44767.270833333336 | 30.488 |
| 44767.28125 | 30.378 |
| 44767.291666666664 | 30.246 |
| 44767.302083333336 | 30.175 |
| 44767.3125 | 30.094 |
| 44767.322916666664 | 29.943 |
| 44767.333333333336 | 29.845 |
| 44767.34375 | 29.747 |
| 44767.354166666664 | 29.684 |
| 44767.364583333336 | 29.648 |
| 44767.375 | 29.605 |
| 44767.385416666664 | 29.561 |
| 44767.395833333336 | 29.518 |
| 44767.40625 | 29.467 |
| 44767.416666666664 | 29.416 |
| 44767.427083333336 | 29.37 |
| 44767.4375 | 29.315 |
| 44767.447916666664 | 29.267 |
| 44767.458333333336 | 29.244 |
| 44767.46875 | 29.356 |
| 44767.479166666664 | 29.253 |
| 44767.489583333336 | 29.223 |
| 44767.5 | 29.099 |
| 44767.510416666664 | 29.069 |
| 44767.520833333336 | 29.06 |
| 44767.53125 | 29.058 |
| 44767.541666666664 | 29.055 |
| 44767.552083333336 | 29.105 |
| 44767.5625 | 29.175 |
| 44767.572916666664 | 29.15 |
| 44767.583333333336 | 29.186 |
| 44767.59375 | 29.154 |
| 44767.604166666664 | 29.102 |
| 44767.614583333336 | 29.081 |
| 44767.625 | 29.115 |
| 44767.635416666664 | 29.102 |
| 44767.645833333336 | 29.164 |
| 44767.65625 | 29.244 |
| 44767.666666666664 | 29.342 |
| 44767.677083333336 | 29.387 |
| 44767.6875 | 29.392 |
| 44767.697916666664 | 29.433 |
| 44767.708333333336 | 29.512 |
| 44767.71875 | 29.598 |
| 44767.729166666664 | 29.835 |
| 44767.739583333336 | 30.017 |
| 44767.75 | 29.955 |
| 44767.760416666664 | 29.872 |
| 44767.770833333336 | 29.913 |
| 44767.78125 | 30.201 |
| 44767.791666666664 | 30.483 |
| 44767.802083333336 | 30.652 |
| 44767.8125 | 30.891 |
| 44767.822916666664 | 31.143 |
| 44767.833333333336 | 31.259 |
| 44767.84375 | 31.278 |
| 44767.854166666664 | 31.33 |
| 44767.864583333336 | 31.31 |
| 44767.875 | 31.134 |
| 44767.885416666664 | 31.004 |
| 44767.895833333336 | 30.889 |
| 44767.90625 | 30.716 |
| 44767.916666666664 | 30.579 |
| 44767.927083333336 | 30.475 |
| 44767.9375 | 30.39 |
| 44767.947916666664 | 30.223 |
| 44767.958333333336 | 30.115 |
| 44767.96875 | 30.07 |
| 44767.979166666664 | 30.038 |
| 44767.989583333336 | 30.018 |
| 44768.0 | 30.292 |
| 44768.010416666664 | 29.837 |
| 44768.020833333336 | 29.827 |
| 44768.03125 | 30 |
| 44768.041666666664 | 29.848 |
| 44768.052083333336 | 29.785 |
| 44768.0625 | 29.743 |
| 44768.072916666664 | 29.837 |
| 44768.083333333336 | 29.804 |
| 44768.09375 | 29.898 |
| 44768.104166666664 | 29.867 |
| 44768.114583333336 | 29.824 |
| 44768.125 | 29.728 |
| 44768.135416666664 | 29.604 |
| 44768.145833333336 | 29.567 |
| 44768.15625 | 29.505 |
| 44768.166666666664 | 29.453 |
| 44768.177083333336 | 29.421 |
| 44768.1875 | 29.399 |
| 44768.197916666664 | 29.368 |
| 44768.208333333336 | 29.295 |
| 44768.21875 | 29.206 |
| 44768.229166666664 | 29.153 |
| 44768.239583333336 | 29.129 |
| 44768.25 | 29.117 |
| 44768.260416666664 | 29.142 |
| 44768.270833333336 | 29.196 |
| 44768.28125 | 29.177 |
| 44768.291666666664 | 29.196 |
| 44768.302083333336 | 29.225 |
| 44768.3125 | 29.215 |
| 44768.322916666664 | 29.17 |
| 44768.333333333336 | 29.103 |
| 44768.34375 | 28.984 |
| 44768.354166666664 | 28.896 |
| 44768.364583333336 | 28.818 |
| 44768.375 | 28.712 |
| 44768.385416666664 | 28.675 |
| 44768.395833333336 | 28.609 |
| 44768.40625 | 28.527 |
| 44768.416666666664 | 28.439 |
| 44768.427083333336 | 28.342 |
| 44768.4375 | 28.293 |
| 44768.447916666664 | 28.224 |
| 44768.458333333336 | 28.189 |
| 44768.46875 | 28.381 |
| 44768.479166666664 | 28.327 |
| 44768.489583333336 | 28.267 |
| 44768.5 | 27.971 |
| 44768.510416666664 | 27.946 |
| 44768.520833333336 | 28.091 |
| 44768.53125 | 27.792 |
| 44768.541666666664 | 28.139 |
| 44768.552083333336 | 27.842 |
| 44768.5625 | 27.915 |
| 44768.572916666664 | 27.98 |
| 44768.583333333336 | 28.035 |
| 44768.59375 | 28.209 |
| 44768.604166666664 | 28.369 |
| 44768.614583333336 | 28.284 |
| 44768.625 | 28.419 |
| 44768.635416666664 | 28.605 |
| 44768.645833333336 | 28.703 |
| 44768.65625 | 28.755 |
| 44768.666666666664 | 28.71 |
| 44768.677083333336 | 28.789 |
| 44768.6875 | 28.693 |
| 44768.697916666664 | 28.64 |
| 44768.708333333336 | 28.548 |
| 44768.71875 | 28.558 |
| 44768.729166666664 | 28.588 |
| 44768.739583333336 | 28.65 |
| 44768.75 | 28.656 |
| 44768.760416666664 | 28.631 |
| 44768.770833333336 | 28.705 |
| 44768.78125 | 28.828 |
| 44768.791666666664 | 28.854 |
| 44768.802083333336 | 28.897 |
| 44768.8125 | 28.951 |
| 44768.822916666664 | 29.06 |
| 44768.833333333336 | 29.105 |
| 44768.84375 | 29.133 |
| 44768.854166666664 | 29.157 |
| 44768.864583333336 | 29.253 |
| 44768.875 | 29.286 |
| 44768.885416666664 | 29.238 |
| 44768.895833333336 | 29.194 |
| 44768.90625 | 29.122 |
| 44768.916666666664 | 28.996 |
| 44768.927083333336 | 28.932 |
| 44768.9375 | 28.838 |
| 44768.947916666664 | 28.765 |
| 44768.958333333336 | 28.715 |
| 44768.96875 | 28.634 |
| 44768.979166666664 | 28.58 |
| 44768.989583333336 | 28.557 |
| 44769.0 | 28.543 |
| 44769.010416666664 | 28.539 |
| 44769.020833333336 | 28.512 |
| 44769.03125 | 28.507 |
| 44769.041666666664 | 28.478 |
| 44769.052083333336 | 28.543 |
| 44769.0625 | 28.52 |
| 44769.072916666664 | 28.361 |
| 44769.083333333336 | 28.299 |
| 44769.09375 | 28.246 |
| 44769.104166666664 | 28.23 |
| 44769.114583333336 | 28.143 |
| 44769.125 | 28.187 |
| 44769.135416666664 | 28.125 |
| 44769.145833333336 | 28.014 |
| 44769.15625 | 28.005 |
| 44769.166666666664 | 27.972 |
| 44769.177083333336 | 27.974 |
| 44769.1875 | 27.903 |
| 44769.197916666664 | 27.884 |
| 44769.208333333336 | 27.917 |
| 44769.21875 | 28.003 |
| 44769.229166666664 | 27.953 |
| 44769.239583333336 | 27.962 |
| 44769.25 | 27.983 |
| 44769.260416666664 | 27.969 |
| 44769.270833333336 | 27.933 |
| 44769.28125 | 27.904 |
| 44769.291666666664 | 27.89 |
| 44769.302083333336 | 27.901 |
| 44769.3125 | 27.891 |
| 44769.322916666664 | 27.893 |
| 44769.333333333336 | 27.892 |
| 44769.34375 | 27.861 |
| 44769.354166666664 | 27.798 |
| 44769.364583333336 | 27.735 |
| 44769.375 | 27.704 |
| 44769.385416666664 | 27.504 |
| 44769.395833333336 | 27.373 |
| 44769.40625 | 27.361 |
| 44769.416666666664 | 27.387 |
| 44769.427083333336 | 27.4 |
| 44769.4375 | 27.371 |
| 44769.447916666664 | 27.346 |
| 44769.458333333336 | 27.315 |
| 44769.46875 | 27.291 |
| 44769.479166666664 | 27.256 |
| 44769.489583333336 | 27.206 |
| 44769.5 | 27.174 |
| 44769.510416666664 | 27.172 |
| 44769.520833333336 | 27.142 |
| 44769.53125 | 27.33 |
| 44769.541666666664 | 27.379 |
| 44769.552083333336 | 27.274 |
| 44769.5625 | 27.249 |
| 44769.572916666664 | 27.428 |
| 44769.583333333336 | 27.498 |
| 44769.59375 | 27.613 |
| 44769.604166666664 | 27.766 |
| 44769.614583333336 | 27.639 |
| 44769.625 | 27.835 |
| 44769.635416666664 | 27.955 |
| 44769.645833333336 | 27.939 |
| 44769.65625 | 27.908 |
| 44769.666666666664 | 28.02 |
| 44769.677083333336 | 28.259 |
| 44769.6875 | 28.552 |
| 44769.697916666664 | 28.738 |
| 44769.708333333336 | 28.871 |
| 44769.71875 | 28.878 |
| 44769.729166666664 | 29.201 |
| 44769.739583333336 | 29.3 |
| 44769.75 | 29.477 |
| 44769.760416666664 | 29.629 |
| 44769.770833333336 | 29.482 |
| 44769.78125 | 29.398 |
| 44769.791666666664 | 29.418 |
| 44769.802083333336 | 29.319 |
| 44769.8125 | 29.287 |
| 44769.822916666664 | 29.336 |
| 44769.833333333336 | 29.311 |
| 44769.84375 | 29.331 |
| 44769.854166666664 | 29.336 |
| 44769.864583333336 | 29.379 |
| 44769.875 | 29.469 |
| 44769.885416666664 | 29.585 |
| 44769.895833333336 | 29.634 |
| 44769.90625 | 29.675 |
| 44769.916666666664 | 29.647 |
| 44769.927083333336 | 29.568 |
| 44769.9375 | 29.47 |
| 44769.947916666664 | 29.389 |
| 44769.958333333336 | 29.223 |
| 44769.96875 | 29.025 |
| 44769.979166666664 | 28.854 |
| 44769.989583333336 | 28.651 |
| 44770.0 | 28.478 |
| 44770.010416666664 | 28.35 |
| 44770.020833333336 | 28.236 |
| 44770.03125 | 28.156 |
| 44770.041666666664 | 28.139 |
| 44770.052083333336 | 28.182 |
| 44770.0625 | 28.291 |
| 44770.072916666664 | 28.278 |
| 44770.083333333336 | 28.349 |
| 44770.09375 | 28.266 |
| 44770.104166666664 | 28.395 |
| 44770.114583333336 | 28.488 |
| 44770.125 | 28.402 |
| 44770.135416666664 | 28.623 |
| 44770.145833333336 | 28.746 |
| 44770.15625 | 28.803 |
| 44770.166666666664 | 28.822 |
| 44770.177083333336 | 28.748 |
| 44770.1875 | 28.732 |
| 44770.197916666664 | 28.8 |
| 44770.208333333336 | 28.825 |
| 44770.21875 | 28.784 |
| 44770.229166666664 | 28.608 |
| 44770.239583333336 | 28.947 |
| 44770.25 | 29.002 |
| 44770.260416666664 | 28.966 |
| 44770.270833333336 | 28.96 |
| 44770.28125 | 29.057 |
| 44770.291666666664 | 29.043 |
| 44770.302083333336 | 29.031 |
| 44770.3125 | 29.012 |
| 44770.322916666664 | 28.926 |
| 44770.333333333336 | 28.911 |
| 44770.34375 | 28.914 |
| 44770.354166666664 | 28.909 |
| 44770.364583333336 | 28.862 |
| 44770.375 | 28.759 |
| 44770.385416666664 | 28.685 |
| 44770.395833333336 | 28.537 |
| 44770.40625 | 28.261 |
| 44770.416666666664 | 27.977 |
| 44770.427083333336 | 27.857 |
| 44770.4375 | 27.79 |
| 44770.447916666664 | 27.76 |
| 44770.458333333336 | 27.731 |
| 44770.46875 | 27.709 |
| 44770.479166666664 | 27.687 |
| 44770.489583333336 | 27.693 |
| 44770.5 | 27.694 |
| 44770.510416666664 | 27.694 |
| 44770.520833333336 | 27.682 |
| 44770.53125 | 27.661 |
| 44770.541666666664 | 27.637 |
| 44770.552083333336 | 27.687 |
| 44770.5625 | 27.591 |
| 44770.572916666664 | 27.564 |
| 44770.583333333336 | 27.844 |
| 44770.59375 | 27.815 |
| 44770.604166666664 | 28.066 |
| 44770.614583333336 | 28.13 |
| 44770.625 | 28.556 |
| 44770.635416666664 | 28.686 |
| 44770.645833333336 | 29.231 |
| 44770.65625 | 29.034 |
| 44770.666666666664 | 29.229 |
| 44770.677083333336 | 29.047 |
| 44770.6875 | 29.532 |
| 44770.697916666664 | 29.698 |
| 44770.708333333336 | 30.04 |
| 44770.71875 | 30.343 |
| 44770.729166666664 | 30.596 |
| 44770.739583333336 | 30.882 |
| 44770.75 | 31.121 |
| 44770.760416666664 | 31.313 |
| 44770.770833333336 | 31.48 |
| 44770.78125 | 31.691 |
| 44770.791666666664 | 31.584 |
| 44770.802083333336 | 31.578 |
| 44770.8125 | 31.619 |
| 44770.822916666664 | 31.473 |
| 44770.833333333336 | 31.406 |
| 44770.84375 | 31.311 |
| 44770.854166666664 | 31.3 |
| 44770.864583333336 | 31.09 |
| 44770.875 | 30.782 |
| 44770.885416666664 | 30.64 |
| 44770.895833333336 | 30.566 |
| 44770.90625 | 30.562 |
| 44770.916666666664 | 30.603 |
| 44770.927083333336 | 30.59 |
| 44770.9375 | 30.558 |
| 44770.947916666664 | 30.524 |
| 44770.958333333336 | 30.458 |
| 44770.96875 | 30.38 |
| 44770.979166666664 | 30.253 |
| 44770.989583333336 | 30.021 |
| 44771.0 | 29.665 |
| 44771.010416666664 | 29.359 |
| 44771.020833333336 | 29.098 |
| 44771.03125 | 28.953 |
| 44771.041666666664 | 28.825 |
| 44771.052083333336 | 28.766 |
| 44771.0625 | 28.71 |
| 44771.072916666664 | 28.686 |
| 44771.083333333336 | 28.687 |
| 44771.09375 | 28.795 |
| 44771.104166666664 | 28.85 |
| 44771.114583333336 | 28.783 |
| 44771.125 | 28.915 |
| 44771.135416666664 | 28.971 |
| 44771.145833333336 | 29.066 |
| 44771.15625 | 29.073 |
| 44771.166666666664 | 29.18 |
| 44771.177083333336 | 29.374 |
| 44771.1875 | 29.589 |
| 44771.197916666664 | 29.619 |
| 44771.208333333336 | 29.605 |
| 44771.21875 | 29.637 |
| 44771.229166666664 | 29.71 |
| 44771.239583333336 | 29.788 |
| 44771.25 | 29.964 |
| 44771.260416666664 | 29.993 |
| 44771.270833333336 | 30.125 |
| 44771.28125 | 30.138 |
| 44771.291666666664 | 30.176 |
| 44771.302083333336 | 30.219 |
| 44771.3125 | 30.242 |
| 44771.322916666664 | 30.228 |
| 44771.333333333336 | 30.226 |
| 44771.34375 | 30.148 |
| 44771.354166666664 | 30.036 |
| 44771.364583333336 | 30.054 |
| 44771.375 | 30.039 |
| 44771.385416666664 | 29.982 |
| 44771.395833333336 | 29.837 |
| 44771.40625 | 29.671 |
| 44771.416666666664 | 29.376 |
| 44771.427083333336 | 28.945 |
| 44771.4375 | 28.81 |
| 44771.447916666664 | 28.697 |
| 44771.458333333336 | 28.624 |
| 44771.46875 | 28.55 |
| 44771.479166666664 | 28.494 |
| 44771.489583333336 | 28.427 |
| 44771.5 | 28.379 |
| 44771.510416666664 | 28.325 |
| 44771.520833333336 | 28.291 |
| 44771.53125 | 28.259 |
| 44771.541666666664 | 28.227 |
| 44771.552083333336 | 28.169 |
| 44771.5625 | 28.139 |
| 44771.572916666664 | 28.185 |
| 44771.583333333336 | 28.145 |
| 44771.59375 | 28.04 |
| 44771.604166666664 | 28.46 |
| 44771.614583333336 | 28.694 |
| 44771.625 | 28.817 |
| 44771.635416666664 | 29.018 |
| 44771.645833333336 | 28.928 |
| 44771.65625 | 29.492 |
| 44771.666666666664 | 29.275 |
| 44771.677083333336 | 29.235 |
| 44771.6875 | 29.805 |
| 44771.697916666664 | 29.887 |
| 44771.708333333336 | 29.788 |
| 44771.71875 | 30.053 |
| 44771.729166666664 | 30.518 |
| 44771.739583333336 | 30.868 |
| 44771.75 | 31.055 |
| 44771.760416666664 | 31.172 |
| 44771.770833333336 | 31.368 |
| 44771.78125 | 31.575 |
| 44771.791666666664 | 31.86 |
| 44771.802083333336 | 31.764 |
| 44771.8125 | 31.821 |
| 44771.822916666664 | 31.782 |
| 44771.833333333336 | 31.706 |
| 44771.84375 | 31.581 |
| 44771.854166666664 | 31.426 |
| 44771.864583333336 | 31.258 |
| 44771.875 | 31.056 |
| 44771.885416666664 | 30.905 |
| 44771.895833333336 | 30.663 |
| 44771.90625 | 30.498 |
| 44771.916666666664 | 30.38 |
| 44771.927083333336 | 30.133 |
| 44771.9375 | 30.023 |
| 44771.947916666664 | 29.897 |
| 44771.958333333336 | 29.768 |
| 44771.96875 | 29.609 |
| 44771.979166666664 | 29.543 |
| 44771.989583333336 | 29.445 |
| 44772.0 | 29.337 |
| 44772.010416666664 | 29.23 |
| 44772.020833333336 | 29.072 |
| 44772.03125 | 28.828 |
| 44772.041666666664 | 28.614 |
| 44772.052083333336 | 28.464 |
| 44772.0625 | 28.365 |
| 44772.072916666664 | 28.337 |
| 44772.083333333336 | 28.378 |
| 44772.09375 | 28.42 |
| 44772.104166666664 | 28.407 |
| 44772.114583333336 | 28.442 |
| 44772.125 | 28.512 |
| 44772.135416666664 | 28.521 |
| 44772.145833333336 | 28.478 |
| 44772.15625 | 28.426 |
| 44772.166666666664 | 28.388 |
| 44772.177083333336 | 28.363 |
| 44772.1875 | 28.313 |
| 44772.197916666664 | 28.295 |
| 44772.208333333336 | 28.257 |
| 44772.21875 | 28.249 |
| 44772.229166666664 | 28.206 |
| 44772.239583333336 | 28.303 |
| 44772.25 | 28.34 |
| 44772.260416666664 | 28.445 |
| 44772.270833333336 | 28.455 |
| 44772.28125 | 28.631 |
| 44772.291666666664 | 28.734 |
| 44772.302083333336 | 28.736 |
| 44772.3125 | 28.806 |
| 44772.322916666664 | 28.794 |
| 44772.333333333336 | 28.872 |
| 44772.34375 | 28.883 |
| 44772.354166666664 | 29 |
| 44772.364583333336 | 29.043 |
| 44772.375 | 28.918 |
| 44772.385416666664 | 28.867 |
| 44772.395833333336 | 28.961 |
| 44772.40625 | 28.913 |
| 44772.416666666664 | 28.826 |
| 44772.427083333336 | 28.634 |
| 44772.4375 | 28.44 |
| 44772.447916666664 | 28.275 |
| 44772.458333333336 | 28.16 |
| 44772.46875 | 28.04 |
| 44772.479166666664 | 27.943 |
| 44772.489583333336 | 27.854 |
| 44772.5 | 27.801 |
| 44772.510416666664 | 27.764 |
| 44772.520833333336 | 27.733 |
| 44772.53125 | 27.72 |
| 44772.541666666664 | 27.706 |
| 44772.552083333336 | 27.696 |
| 44772.5625 | 27.69 |
| 44772.572916666664 | 27.705 |
| 44772.583333333336 | 27.712 |
| 44772.59375 | 27.727 |
| 44772.604166666664 | 27.745 |
| 44772.614583333336 | 27.798 |
| 44772.625 | 27.804 |
| 44772.635416666664 | 27.723 |
| 44772.645833333336 | 27.905 |
| 44772.65625 | 28.082 |
| 44772.666666666664 | 28.463 |
| 44772.677083333336 | 28.621 |
| 44772.6875 | 29.065 |
| 44772.697916666664 | 29.214 |
| 44772.708333333336 | 29.386 |
| 44772.71875 | 29.334 |
| 44772.729166666664 | 29.415 |
| 44772.739583333336 | 29.586 |
| 44772.75 | 29.944 |
| 44772.760416666664 | 30.287 |
| 44772.770833333336 | 30.581 |
| 44772.78125 | 30.72 |
| 44772.791666666664 | 30.884 |
| 44772.802083333336 | 30.969 |
| 44772.8125 | 31.137 |
| 44772.822916666664 | 31.242 |
| 44772.833333333336 | 31.274 |
| 44772.84375 | 31.263 |
| 44772.854166666664 | 31.29 |
| 44772.864583333336 | 31.347 |
| 44772.875 | 31.242 |
| 44772.885416666664 | 31.128 |
| 44772.895833333336 | 31.047 |
| 44772.90625 | 30.901 |
| 44772.916666666664 | 30.792 |
| 44772.927083333336 | 30.668 |
| 44772.9375 | 30.463 |
| 44772.947916666664 | 30.276 |
| 44772.958333333336 | 30.149 |
| 44772.96875 | 30.032 |
| 44772.979166666664 | 29.928 |
| 44772.989583333336 | 29.854 |
| 44773.0 | 29.807 |
| 44773.010416666664 | 29.763 |
| 44773.020833333336 | 29.684 |
| 44773.03125 | 29.586 |
| 44773.041666666664 | 29.456 |
| 44773.052083333336 | 29.295 |
| 44773.0625 | 29.138 |
| 44773.072916666664 | 28.973 |
| 44773.083333333336 | 28.811 |
| 44773.09375 | 28.667 |
| 44773.104166666664 | 28.576 |
| 44773.114583333336 | 28.482 |
| 44773.125 | 28.42 |
| 44773.135416666664 | 28.454 |
| 44773.145833333336 | 28.53 |
| 44773.15625 | 28.438 |
| 44773.166666666664 | 28.45 |
| 44773.177083333336 | 28.382 |
| 44773.1875 | 28.362 |
| 44773.197916666664 | 28.29 |
| 44773.208333333336 | 28.227 |
| 44773.21875 | 28.153 |
| 44773.229166666664 | 28.028 |
| 44773.239583333336 | 27.986 |
| 44773.25 | 27.93 |
| 44773.260416666664 | 27.86 |
| 44773.270833333336 | 28.072 |
| 44773.28125 | 28.017 |
| 44773.291666666664 | 28.17 |
| 44773.302083333336 | 28.327 |
| 44773.3125 | 28.311 |
| 44773.322916666664 | 28.401 |
| 44773.333333333336 | 28.466 |
| 44773.34375 | 28.485 |
| 44773.354166666664 | 28.494 |
| 44773.364583333336 | 28.344 |
| 44773.375 | 28.43 |
| 44773.385416666664 | 28.416 |
| 44773.395833333336 | 28.35 |
| 44773.40625 | 28.256 |
| 44773.416666666664 | 28.266 |
| 44773.427083333336 | 28.257 |
| 44773.4375 | 28.215 |
| 44773.447916666664 | 28.116 |
| 44773.458333333336 | 27.995 |
| 44773.46875 | 27.81 |
| 44773.479166666664 | 27.61 |
| 44773.489583333336 | 27.5 |
| 44773.5 | 27.411 |
| 44773.510416666664 | 27.321 |
| 44773.520833333336 | 27.292 |
| 44773.53125 | 27.28 |
| 44773.541666666664 | 27.253 |
| 44773.552083333336 | 27.294 |
| 44773.5625 | 27.335 |
| 44773.572916666664 | 27.38 |
| 44773.583333333336 | 27.423 |
| 44773.59375 | 27.467 |
| 44773.604166666664 | 27.485 |
| 44773.614583333336 | 27.511 |
| 44773.625 | 27.52 |
| 44773.635416666664 | 27.563 |
| 44773.645833333336 | 27.704 |
| 44773.65625 | 27.85 |
| 44773.666666666664 | 27.959 |
| 44773.677083333336 | 28.388 |
| 44773.6875 | 28.52 |
| 44773.697916666664 | 28.722 |
| 44773.708333333336 | 29.095 |
| 44773.71875 | 29.377 |
| 44773.729166666664 | 28.772 |
| 44773.739583333336 | 29.145 |
| 44773.75 | 28.876 |
| 44773.760416666664 | 29.002 |
| 44773.770833333336 | 29.219 |
| 44773.78125 | 29.546 |
| 44773.791666666664 | 29.708 |
| 44773.802083333336 | 29.719 |
| 44773.8125 | 29.749 |
| 44773.822916666664 | 29.748 |
| 44773.833333333336 | 29.733 |
| 44773.84375 | 29.72 |
| 44773.854166666664 | 29.716 |
| 44773.864583333336 | 29.712 |
| 44773.875 | 29.704 |
| 44773.885416666664 | 29.696 |
| 44773.895833333336 | 29.66 |
| 44773.90625 | 29.608 |
| 44773.916666666664 | 29.616 |
| 44773.927083333336 | 29.571 |
| 44773.9375 | 29.49 |
| 44773.947916666664 | 29.386 |
| 44773.958333333336 | 29.169 |
| 44773.96875 | 29.022 |
| 44773.979166666664 | 28.841 |
| 44773.989583333336 | 28.663 |
| 44774.0 | 28.579 |
| 44774.010416666664 | 28.45 |
| 44774.020833333336 | 28.339 |
| 44774.03125 | 28.273 |
| 44774.041666666664 | 28.195 |
| 44774.052083333336 | 28.065 |
| 44774.0625 | 28.008 |
| 44774.072916666664 | 27.972 |
| 44774.083333333336 | 27.831 |
| 44774.09375 | 27.801 |
| 44774.104166666664 | 27.777 |
| 44774.114583333336 | 27.719 |
| 44774.125 | 27.625 |
| 44774.135416666664 | 27.632 |
| 44774.145833333336 | 27.575 |
| 44774.15625 | 27.523 |